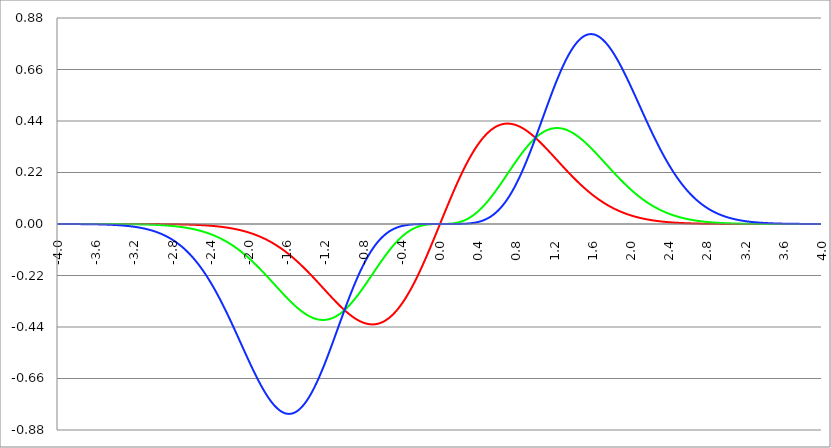
| Category | Series 1 | Series 0 | Series 2 |
|---|---|---|---|
| -4.0 | 0 | 0 | 0 |
| -3.996 | 0 | 0 | 0 |
| -3.992 | 0 | 0 | 0 |
| -3.988 | 0 | 0 | 0 |
| -3.984 | 0 | 0 | 0 |
| -3.98 | 0 | 0 | 0 |
| -3.976 | 0 | 0 | 0 |
| -3.972 | 0 | 0 | 0 |
| -3.968 | 0 | 0 | 0 |
| -3.964 | 0 | 0 | 0 |
| -3.96 | 0 | 0 | 0 |
| -3.956 | 0 | 0 | 0 |
| -3.952 | 0 | 0 | 0 |
| -3.948 | 0 | 0 | 0 |
| -3.944 | 0 | 0 | 0 |
| -3.94 | 0 | 0 | 0 |
| -3.936 | 0 | 0 | 0 |
| -3.932 | 0 | 0 | 0 |
| -3.928 | 0 | 0 | 0 |
| -3.924 | 0 | 0 | 0 |
| -3.92 | 0 | 0 | 0 |
| -3.916 | 0 | 0 | 0 |
| -3.912 | 0 | 0 | 0 |
| -3.908 | 0 | 0 | 0 |
| -3.904 | 0 | 0 | 0 |
| -3.9 | 0 | 0 | 0 |
| -3.896 | 0 | 0 | 0 |
| -3.892 | 0 | 0 | 0 |
| -3.888 | 0 | 0 | 0 |
| -3.884 | 0 | 0 | 0 |
| -3.88 | 0 | 0 | 0 |
| -3.876 | 0 | 0 | 0 |
| -3.872 | 0 | 0 | 0 |
| -3.868 | 0 | 0 | 0 |
| -3.864 | 0 | 0 | 0 |
| -3.86 | 0 | 0 | 0 |
| -3.856 | 0 | 0 | 0 |
| -3.852 | 0 | 0 | 0 |
| -3.848 | 0 | 0 | 0 |
| -3.844 | 0 | 0 | 0 |
| -3.84 | 0 | 0 | 0 |
| -3.836 | 0 | 0 | 0 |
| -3.832 | 0 | 0 | 0 |
| -3.828 | 0 | 0 | 0 |
| -3.824 | 0 | 0 | 0 |
| -3.82 | 0 | 0 | 0 |
| -3.816 | 0 | 0 | 0 |
| -3.812 | 0 | 0 | 0 |
| -3.808 | 0 | 0 | 0 |
| -3.804 | 0 | 0 | 0 |
| -3.8 | 0 | 0 | 0 |
| -3.796 | 0 | 0 | 0 |
| -3.792 | 0 | 0 | 0 |
| -3.788 | 0 | 0 | 0 |
| -3.784 | 0 | 0 | 0 |
| -3.78 | 0 | 0 | 0 |
| -3.776 | 0 | 0 | 0 |
| -3.772 | 0 | 0 | -0.001 |
| -3.768 | 0 | 0 | -0.001 |
| -3.764 | 0 | 0 | -0.001 |
| -3.76 | 0 | 0 | -0.001 |
| -3.756 | 0 | 0 | -0.001 |
| -3.752 | 0 | 0 | -0.001 |
| -3.748 | 0 | 0 | -0.001 |
| -3.744 | 0 | 0 | -0.001 |
| -3.74 | 0 | 0 | -0.001 |
| -3.736 | 0 | 0 | -0.001 |
| -3.732 | 0 | 0 | -0.001 |
| -3.728 | 0 | 0 | -0.001 |
| -3.724 | 0 | 0 | -0.001 |
| -3.72 | 0 | 0 | -0.001 |
| -3.716 | 0 | 0 | -0.001 |
| -3.712 | 0 | 0 | -0.001 |
| -3.708 | 0 | 0 | -0.001 |
| -3.704 | 0 | 0 | -0.001 |
| -3.7 | 0 | 0 | -0.001 |
| -3.696 | 0 | 0 | -0.001 |
| -3.692 | 0 | 0 | -0.001 |
| -3.688 | 0 | 0 | -0.001 |
| -3.684 | 0 | 0 | -0.001 |
| -3.68 | 0 | 0 | -0.001 |
| -3.676 | 0 | 0 | -0.001 |
| -3.672 | 0 | 0 | -0.001 |
| -3.668 | 0 | 0 | -0.001 |
| -3.664 | 0 | 0 | -0.001 |
| -3.66 | 0 | 0 | -0.001 |
| -3.656 | 0 | 0 | -0.001 |
| -3.652 | 0 | 0 | -0.001 |
| -3.648 | 0 | 0 | -0.001 |
| -3.644 | 0 | 0 | -0.001 |
| -3.64 | 0 | 0 | -0.001 |
| -3.636 | 0 | 0 | -0.001 |
| -3.632 | 0 | 0 | -0.001 |
| -3.628 | 0 | 0 | -0.001 |
| -3.624 | 0 | 0 | -0.001 |
| -3.62 | 0 | 0 | -0.001 |
| -3.616 | 0 | 0 | -0.001 |
| -3.612 | 0 | 0 | -0.001 |
| -3.608 | 0 | 0 | -0.001 |
| -3.604 | 0 | 0 | -0.001 |
| -3.6 | 0 | 0 | -0.001 |
| -3.596 | 0 | 0 | -0.001 |
| -3.592 | 0 | 0 | -0.001 |
| -3.588 | 0 | 0 | -0.002 |
| -3.584 | 0 | 0 | -0.002 |
| -3.58 | 0 | 0 | -0.002 |
| -3.576 | 0 | 0 | -0.002 |
| -3.572 | 0 | 0 | -0.002 |
| -3.568 | 0 | 0 | -0.002 |
| -3.564 | 0 | 0 | -0.002 |
| -3.56 | 0 | 0 | -0.002 |
| -3.556 | 0 | 0 | -0.002 |
| -3.552 | 0 | 0 | -0.002 |
| -3.548 | 0 | 0 | -0.002 |
| -3.544 | 0 | 0 | -0.002 |
| -3.54 | 0 | 0 | -0.002 |
| -3.536 | 0 | 0 | -0.002 |
| -3.532 | 0 | 0 | -0.002 |
| -3.528 | 0 | 0 | -0.002 |
| -3.524 | 0 | 0 | -0.002 |
| -3.52 | 0 | 0 | -0.002 |
| -3.516 | 0 | 0 | -0.002 |
| -3.512 | 0 | 0 | -0.002 |
| -3.508 | 0 | 0 | -0.002 |
| -3.504 | 0 | 0 | -0.002 |
| -3.5 | 0 | 0 | -0.003 |
| -3.496 | 0 | 0 | -0.003 |
| -3.492 | 0 | 0 | -0.003 |
| -3.488 | 0 | 0 | -0.003 |
| -3.484 | 0 | 0 | -0.003 |
| -3.48 | 0 | 0 | -0.003 |
| -3.476 | 0 | 0 | -0.003 |
| -3.472 | 0 | 0 | -0.003 |
| -3.467999999999999 | 0 | 0 | -0.003 |
| -3.463999999999999 | 0 | 0 | -0.003 |
| -3.459999999999999 | 0 | 0 | -0.003 |
| -3.455999999999999 | 0 | 0 | -0.003 |
| -3.451999999999999 | 0 | 0 | -0.003 |
| -3.447999999999999 | 0 | 0 | -0.003 |
| -3.443999999999999 | 0 | 0 | -0.003 |
| -3.439999999999999 | 0 | 0 | -0.003 |
| -3.435999999999999 | 0 | 0 | -0.004 |
| -3.431999999999999 | 0 | 0 | -0.004 |
| -3.427999999999999 | 0 | 0 | -0.004 |
| -3.423999999999999 | 0 | 0 | -0.004 |
| -3.419999999999999 | 0 | 0 | -0.004 |
| -3.415999999999999 | 0 | 0 | -0.004 |
| -3.411999999999999 | 0 | 0 | -0.004 |
| -3.407999999999999 | 0 | 0 | -0.004 |
| -3.403999999999999 | 0 | 0 | -0.004 |
| -3.399999999999999 | 0 | 0 | -0.004 |
| -3.395999999999999 | 0 | 0 | -0.004 |
| -3.391999999999999 | 0 | 0 | -0.005 |
| -3.387999999999999 | 0 | 0 | -0.005 |
| -3.383999999999999 | 0 | 0 | -0.005 |
| -3.379999999999999 | 0 | 0 | -0.005 |
| -3.375999999999999 | 0 | 0 | -0.005 |
| -3.371999999999999 | 0 | 0 | -0.005 |
| -3.367999999999999 | 0 | 0 | -0.005 |
| -3.363999999999999 | 0 | 0 | -0.005 |
| -3.359999999999999 | 0 | 0 | -0.005 |
| -3.355999999999999 | 0 | 0 | -0.005 |
| -3.351999999999999 | 0 | 0 | -0.006 |
| -3.347999999999999 | 0 | -0.001 | -0.006 |
| -3.343999999999999 | 0 | -0.001 | -0.006 |
| -3.339999999999999 | 0 | -0.001 | -0.006 |
| -3.335999999999999 | 0 | -0.001 | -0.006 |
| -3.331999999999999 | 0 | -0.001 | -0.006 |
| -3.327999999999999 | 0 | -0.001 | -0.006 |
| -3.323999999999999 | 0 | -0.001 | -0.006 |
| -3.319999999999999 | 0 | -0.001 | -0.007 |
| -3.315999999999999 | 0 | -0.001 | -0.007 |
| -3.311999999999999 | 0 | -0.001 | -0.007 |
| -3.307999999999999 | 0 | -0.001 | -0.007 |
| -3.303999999999999 | 0 | -0.001 | -0.007 |
| -3.299999999999999 | 0 | -0.001 | -0.007 |
| -3.295999999999999 | 0 | -0.001 | -0.007 |
| -3.291999999999999 | 0 | -0.001 | -0.008 |
| -3.288 | 0 | -0.001 | -0.008 |
| -3.284 | 0 | -0.001 | -0.008 |
| -3.279999999999999 | 0 | -0.001 | -0.008 |
| -3.275999999999999 | 0 | -0.001 | -0.008 |
| -3.271999999999999 | 0 | -0.001 | -0.008 |
| -3.268 | 0 | -0.001 | -0.009 |
| -3.264 | 0 | -0.001 | -0.009 |
| -3.259999999999999 | 0 | -0.001 | -0.009 |
| -3.255999999999999 | 0 | -0.001 | -0.009 |
| -3.251999999999999 | 0 | -0.001 | -0.009 |
| -3.248 | 0 | -0.001 | -0.009 |
| -3.244 | 0 | -0.001 | -0.01 |
| -3.239999999999999 | 0 | -0.001 | -0.01 |
| -3.235999999999999 | 0 | -0.001 | -0.01 |
| -3.231999999999999 | 0 | -0.001 | -0.01 |
| -3.228 | 0 | -0.001 | -0.01 |
| -3.224 | 0 | -0.001 | -0.011 |
| -3.219999999999999 | 0 | -0.001 | -0.011 |
| -3.215999999999999 | 0 | -0.001 | -0.011 |
| -3.211999999999999 | 0 | -0.001 | -0.011 |
| -3.208 | 0 | -0.001 | -0.012 |
| -3.204 | 0 | -0.001 | -0.012 |
| -3.199999999999999 | 0 | -0.001 | -0.012 |
| -3.195999999999999 | 0 | -0.001 | -0.012 |
| -3.191999999999999 | 0 | -0.001 | -0.012 |
| -3.188 | 0 | -0.001 | -0.013 |
| -3.184 | 0 | -0.001 | -0.013 |
| -3.179999999999999 | 0 | -0.001 | -0.013 |
| -3.175999999999999 | 0 | -0.001 | -0.013 |
| -3.171999999999999 | 0 | -0.001 | -0.014 |
| -3.168 | 0 | -0.001 | -0.014 |
| -3.164 | 0 | -0.001 | -0.014 |
| -3.159999999999999 | 0 | -0.001 | -0.015 |
| -3.155999999999999 | 0 | -0.001 | -0.015 |
| -3.151999999999999 | 0 | -0.002 | -0.015 |
| -3.148 | 0 | -0.002 | -0.015 |
| -3.144 | 0 | -0.002 | -0.016 |
| -3.139999999999999 | 0 | -0.002 | -0.016 |
| -3.135999999999999 | 0 | -0.002 | -0.016 |
| -3.131999999999999 | 0 | -0.002 | -0.017 |
| -3.128 | 0 | -0.002 | -0.017 |
| -3.124 | 0 | -0.002 | -0.017 |
| -3.119999999999999 | 0 | -0.002 | -0.018 |
| -3.115999999999999 | 0 | -0.002 | -0.018 |
| -3.111999999999999 | 0 | -0.002 | -0.018 |
| -3.108 | 0 | -0.002 | -0.019 |
| -3.104 | 0 | -0.002 | -0.019 |
| -3.099999999999999 | 0 | -0.002 | -0.019 |
| -3.095999999999999 | 0 | -0.002 | -0.02 |
| -3.091999999999999 | 0 | -0.002 | -0.02 |
| -3.088 | 0 | -0.002 | -0.02 |
| -3.084 | 0 | -0.002 | -0.021 |
| -3.079999999999999 | 0 | -0.002 | -0.021 |
| -3.075999999999999 | 0 | -0.002 | -0.021 |
| -3.071999999999999 | 0 | -0.002 | -0.022 |
| -3.068 | 0 | -0.002 | -0.022 |
| -3.064 | 0 | -0.002 | -0.023 |
| -3.059999999999999 | 0 | -0.002 | -0.023 |
| -3.055999999999999 | 0 | -0.003 | -0.023 |
| -3.051999999999999 | 0 | -0.003 | -0.024 |
| -3.048 | 0 | -0.003 | -0.024 |
| -3.044 | 0 | -0.003 | -0.025 |
| -3.039999999999999 | 0 | -0.003 | -0.025 |
| -3.035999999999999 | 0 | -0.003 | -0.026 |
| -3.031999999999999 | 0 | -0.003 | -0.026 |
| -3.028 | 0 | -0.003 | -0.027 |
| -3.024 | 0 | -0.003 | -0.027 |
| -3.019999999999999 | 0 | -0.003 | -0.027 |
| -3.015999999999999 | 0 | -0.003 | -0.028 |
| -3.011999999999999 | 0 | -0.003 | -0.028 |
| -3.008 | 0 | -0.003 | -0.029 |
| -3.004 | 0 | -0.003 | -0.029 |
| -2.999999999999999 | 0 | -0.003 | -0.03 |
| -2.995999999999999 | 0 | -0.003 | -0.031 |
| -2.991999999999999 | 0 | -0.003 | -0.031 |
| -2.988 | 0 | -0.004 | -0.032 |
| -2.984 | 0 | -0.004 | -0.032 |
| -2.979999999999999 | 0 | -0.004 | -0.033 |
| -2.975999999999999 | 0 | -0.004 | -0.033 |
| -2.971999999999999 | 0 | -0.004 | -0.034 |
| -2.968 | 0 | -0.004 | -0.034 |
| -2.964 | 0 | -0.004 | -0.035 |
| -2.959999999999999 | 0 | -0.004 | -0.036 |
| -2.955999999999999 | 0 | -0.004 | -0.036 |
| -2.951999999999999 | 0 | -0.004 | -0.037 |
| -2.948 | 0 | -0.004 | -0.037 |
| -2.944 | -0.001 | -0.004 | -0.038 |
| -2.939999999999999 | -0.001 | -0.004 | -0.039 |
| -2.935999999999999 | -0.001 | -0.005 | -0.039 |
| -2.931999999999999 | -0.001 | -0.005 | -0.04 |
| -2.928 | -0.001 | -0.005 | -0.041 |
| -2.924 | -0.001 | -0.005 | -0.041 |
| -2.919999999999999 | -0.001 | -0.005 | -0.042 |
| -2.915999999999999 | -0.001 | -0.005 | -0.043 |
| -2.911999999999999 | -0.001 | -0.005 | -0.043 |
| -2.908 | -0.001 | -0.005 | -0.044 |
| -2.904 | -0.001 | -0.005 | -0.045 |
| -2.899999999999999 | -0.001 | -0.005 | -0.046 |
| -2.895999999999999 | -0.001 | -0.006 | -0.046 |
| -2.891999999999999 | -0.001 | -0.006 | -0.047 |
| -2.887999999999999 | -0.001 | -0.006 | -0.048 |
| -2.883999999999999 | -0.001 | -0.006 | -0.049 |
| -2.879999999999999 | -0.001 | -0.006 | -0.05 |
| -2.875999999999999 | -0.001 | -0.006 | -0.05 |
| -2.871999999999999 | -0.001 | -0.006 | -0.051 |
| -2.867999999999999 | -0.001 | -0.006 | -0.052 |
| -2.863999999999999 | -0.001 | -0.006 | -0.053 |
| -2.859999999999999 | -0.001 | -0.007 | -0.054 |
| -2.855999999999999 | -0.001 | -0.007 | -0.054 |
| -2.851999999999999 | -0.001 | -0.007 | -0.055 |
| -2.847999999999999 | -0.001 | -0.007 | -0.056 |
| -2.843999999999999 | -0.001 | -0.007 | -0.057 |
| -2.839999999999999 | -0.001 | -0.007 | -0.058 |
| -2.835999999999999 | -0.001 | -0.007 | -0.059 |
| -2.831999999999999 | -0.001 | -0.007 | -0.06 |
| -2.827999999999999 | -0.001 | -0.008 | -0.061 |
| -2.823999999999999 | -0.001 | -0.008 | -0.062 |
| -2.819999999999999 | -0.001 | -0.008 | -0.063 |
| -2.815999999999999 | -0.001 | -0.008 | -0.064 |
| -2.811999999999999 | -0.001 | -0.008 | -0.065 |
| -2.807999999999999 | -0.001 | -0.008 | -0.066 |
| -2.803999999999999 | -0.001 | -0.008 | -0.067 |
| -2.799999999999999 | -0.001 | -0.009 | -0.068 |
| -2.795999999999999 | -0.001 | -0.009 | -0.069 |
| -2.791999999999999 | -0.001 | -0.009 | -0.07 |
| -2.787999999999999 | -0.001 | -0.009 | -0.071 |
| -2.783999999999999 | -0.001 | -0.009 | -0.072 |
| -2.779999999999999 | -0.001 | -0.009 | -0.073 |
| -2.775999999999999 | -0.001 | -0.01 | -0.074 |
| -2.771999999999999 | -0.001 | -0.01 | -0.075 |
| -2.767999999999999 | -0.001 | -0.01 | -0.076 |
| -2.763999999999999 | -0.001 | -0.01 | -0.078 |
| -2.759999999999999 | -0.001 | -0.01 | -0.079 |
| -2.755999999999999 | -0.001 | -0.011 | -0.08 |
| -2.751999999999999 | -0.001 | -0.011 | -0.081 |
| -2.747999999999999 | -0.001 | -0.011 | -0.082 |
| -2.743999999999999 | -0.001 | -0.011 | -0.084 |
| -2.739999999999999 | -0.002 | -0.011 | -0.085 |
| -2.735999999999999 | -0.002 | -0.011 | -0.086 |
| -2.731999999999999 | -0.002 | -0.012 | -0.087 |
| -2.727999999999999 | -0.002 | -0.012 | -0.089 |
| -2.723999999999999 | -0.002 | -0.012 | -0.09 |
| -2.719999999999999 | -0.002 | -0.012 | -0.091 |
| -2.715999999999999 | -0.002 | -0.013 | -0.092 |
| -2.711999999999999 | -0.002 | -0.013 | -0.094 |
| -2.707999999999999 | -0.002 | -0.013 | -0.095 |
| -2.703999999999999 | -0.002 | -0.013 | -0.097 |
| -2.699999999999999 | -0.002 | -0.013 | -0.098 |
| -2.695999999999999 | -0.002 | -0.014 | -0.099 |
| -2.691999999999999 | -0.002 | -0.014 | -0.101 |
| -2.687999999999999 | -0.002 | -0.014 | -0.102 |
| -2.683999999999999 | -0.002 | -0.014 | -0.104 |
| -2.679999999999999 | -0.002 | -0.015 | -0.105 |
| -2.675999999999999 | -0.002 | -0.015 | -0.107 |
| -2.671999999999999 | -0.002 | -0.015 | -0.108 |
| -2.667999999999999 | -0.002 | -0.015 | -0.11 |
| -2.663999999999999 | -0.002 | -0.016 | -0.111 |
| -2.659999999999999 | -0.002 | -0.016 | -0.113 |
| -2.655999999999999 | -0.002 | -0.016 | -0.114 |
| -2.651999999999999 | -0.002 | -0.016 | -0.116 |
| -2.647999999999999 | -0.002 | -0.017 | -0.117 |
| -2.643999999999999 | -0.002 | -0.017 | -0.119 |
| -2.639999999999999 | -0.002 | -0.017 | -0.121 |
| -2.635999999999999 | -0.003 | -0.018 | -0.122 |
| -2.631999999999999 | -0.003 | -0.018 | -0.124 |
| -2.627999999999999 | -0.003 | -0.018 | -0.126 |
| -2.623999999999999 | -0.003 | -0.018 | -0.127 |
| -2.619999999999999 | -0.003 | -0.019 | -0.129 |
| -2.615999999999999 | -0.003 | -0.019 | -0.131 |
| -2.611999999999999 | -0.003 | -0.019 | -0.132 |
| -2.607999999999999 | -0.003 | -0.02 | -0.134 |
| -2.603999999999999 | -0.003 | -0.02 | -0.136 |
| -2.599999999999999 | -0.003 | -0.02 | -0.138 |
| -2.595999999999999 | -0.003 | -0.021 | -0.14 |
| -2.591999999999999 | -0.003 | -0.021 | -0.141 |
| -2.587999999999999 | -0.003 | -0.021 | -0.143 |
| -2.583999999999999 | -0.003 | -0.022 | -0.145 |
| -2.579999999999999 | -0.003 | -0.022 | -0.147 |
| -2.575999999999999 | -0.003 | -0.022 | -0.149 |
| -2.571999999999999 | -0.003 | -0.023 | -0.151 |
| -2.567999999999999 | -0.004 | -0.023 | -0.153 |
| -2.563999999999999 | -0.004 | -0.024 | -0.155 |
| -2.559999999999999 | -0.004 | -0.024 | -0.157 |
| -2.555999999999999 | -0.004 | -0.024 | -0.159 |
| -2.551999999999999 | -0.004 | -0.025 | -0.161 |
| -2.547999999999999 | -0.004 | -0.025 | -0.163 |
| -2.543999999999999 | -0.004 | -0.025 | -0.165 |
| -2.539999999999999 | -0.004 | -0.026 | -0.167 |
| -2.535999999999999 | -0.004 | -0.026 | -0.169 |
| -2.531999999999999 | -0.004 | -0.027 | -0.171 |
| -2.527999999999999 | -0.004 | -0.027 | -0.173 |
| -2.523999999999999 | -0.004 | -0.028 | -0.175 |
| -2.519999999999999 | -0.004 | -0.028 | -0.177 |
| -2.515999999999999 | -0.004 | -0.028 | -0.18 |
| -2.511999999999999 | -0.005 | -0.029 | -0.182 |
| -2.507999999999999 | -0.005 | -0.029 | -0.184 |
| -2.503999999999999 | -0.005 | -0.03 | -0.186 |
| -2.499999999999999 | -0.005 | -0.03 | -0.189 |
| -2.495999999999999 | -0.005 | -0.031 | -0.191 |
| -2.491999999999999 | -0.005 | -0.031 | -0.193 |
| -2.487999999999999 | -0.005 | -0.032 | -0.195 |
| -2.483999999999999 | -0.005 | -0.032 | -0.198 |
| -2.479999999999999 | -0.005 | -0.033 | -0.2 |
| -2.475999999999999 | -0.005 | -0.033 | -0.202 |
| -2.471999999999999 | -0.005 | -0.034 | -0.205 |
| -2.467999999999999 | -0.006 | -0.034 | -0.207 |
| -2.463999999999999 | -0.006 | -0.035 | -0.21 |
| -2.459999999999999 | -0.006 | -0.035 | -0.212 |
| -2.455999999999999 | -0.006 | -0.036 | -0.215 |
| -2.451999999999999 | -0.006 | -0.036 | -0.217 |
| -2.447999999999999 | -0.006 | -0.037 | -0.22 |
| -2.443999999999999 | -0.006 | -0.037 | -0.222 |
| -2.439999999999999 | -0.006 | -0.038 | -0.225 |
| -2.435999999999999 | -0.006 | -0.038 | -0.227 |
| -2.431999999999999 | -0.007 | -0.039 | -0.23 |
| -2.427999999999999 | -0.007 | -0.039 | -0.232 |
| -2.423999999999999 | -0.007 | -0.04 | -0.235 |
| -2.419999999999999 | -0.007 | -0.041 | -0.238 |
| -2.415999999999999 | -0.007 | -0.041 | -0.24 |
| -2.411999999999999 | -0.007 | -0.042 | -0.243 |
| -2.407999999999999 | -0.007 | -0.042 | -0.245 |
| -2.403999999999999 | -0.007 | -0.043 | -0.248 |
| -2.399999999999999 | -0.008 | -0.044 | -0.251 |
| -2.395999999999999 | -0.008 | -0.044 | -0.254 |
| -2.391999999999999 | -0.008 | -0.045 | -0.256 |
| -2.387999999999999 | -0.008 | -0.045 | -0.259 |
| -2.383999999999999 | -0.008 | -0.046 | -0.262 |
| -2.379999999999999 | -0.008 | -0.047 | -0.265 |
| -2.375999999999999 | -0.008 | -0.047 | -0.268 |
| -2.371999999999999 | -0.009 | -0.048 | -0.27 |
| -2.367999999999998 | -0.009 | -0.049 | -0.273 |
| -2.363999999999998 | -0.009 | -0.049 | -0.276 |
| -2.359999999999998 | -0.009 | -0.05 | -0.279 |
| -2.355999999999998 | -0.009 | -0.051 | -0.282 |
| -2.351999999999998 | -0.009 | -0.052 | -0.285 |
| -2.347999999999998 | -0.009 | -0.052 | -0.288 |
| -2.343999999999998 | -0.01 | -0.053 | -0.291 |
| -2.339999999999998 | -0.01 | -0.054 | -0.294 |
| -2.335999999999998 | -0.01 | -0.054 | -0.297 |
| -2.331999999999998 | -0.01 | -0.055 | -0.3 |
| -2.327999999999998 | -0.01 | -0.056 | -0.303 |
| -2.323999999999998 | -0.01 | -0.057 | -0.306 |
| -2.319999999999998 | -0.011 | -0.057 | -0.309 |
| -2.315999999999998 | -0.011 | -0.058 | -0.312 |
| -2.311999999999998 | -0.011 | -0.059 | -0.315 |
| -2.307999999999998 | -0.011 | -0.06 | -0.318 |
| -2.303999999999998 | -0.011 | -0.061 | -0.321 |
| -2.299999999999998 | -0.012 | -0.061 | -0.325 |
| -2.295999999999998 | -0.012 | -0.062 | -0.328 |
| -2.291999999999998 | -0.012 | -0.063 | -0.331 |
| -2.287999999999998 | -0.012 | -0.064 | -0.334 |
| -2.283999999999998 | -0.012 | -0.065 | -0.337 |
| -2.279999999999998 | -0.013 | -0.065 | -0.34 |
| -2.275999999999998 | -0.013 | -0.066 | -0.344 |
| -2.271999999999998 | -0.013 | -0.067 | -0.347 |
| -2.267999999999998 | -0.013 | -0.068 | -0.35 |
| -2.263999999999998 | -0.013 | -0.069 | -0.353 |
| -2.259999999999998 | -0.014 | -0.07 | -0.357 |
| -2.255999999999998 | -0.014 | -0.071 | -0.36 |
| -2.251999999999998 | -0.014 | -0.072 | -0.363 |
| -2.247999999999998 | -0.014 | -0.073 | -0.367 |
| -2.243999999999998 | -0.015 | -0.073 | -0.37 |
| -2.239999999999998 | -0.015 | -0.074 | -0.373 |
| -2.235999999999998 | -0.015 | -0.075 | -0.377 |
| -2.231999999999998 | -0.015 | -0.076 | -0.38 |
| -2.227999999999998 | -0.016 | -0.077 | -0.383 |
| -2.223999999999998 | -0.016 | -0.078 | -0.387 |
| -2.219999999999998 | -0.016 | -0.079 | -0.39 |
| -2.215999999999998 | -0.016 | -0.08 | -0.394 |
| -2.211999999999998 | -0.017 | -0.081 | -0.397 |
| -2.207999999999998 | -0.017 | -0.082 | -0.401 |
| -2.203999999999998 | -0.017 | -0.083 | -0.404 |
| -2.199999999999998 | -0.017 | -0.084 | -0.408 |
| -2.195999999999998 | -0.018 | -0.085 | -0.411 |
| -2.191999999999998 | -0.018 | -0.086 | -0.414 |
| -2.187999999999998 | -0.018 | -0.087 | -0.418 |
| -2.183999999999998 | -0.019 | -0.088 | -0.421 |
| -2.179999999999998 | -0.019 | -0.089 | -0.425 |
| -2.175999999999998 | -0.019 | -0.09 | -0.428 |
| -2.171999999999998 | -0.019 | -0.092 | -0.432 |
| -2.167999999999998 | -0.02 | -0.093 | -0.436 |
| -2.163999999999998 | -0.02 | -0.094 | -0.439 |
| -2.159999999999998 | -0.02 | -0.095 | -0.443 |
| -2.155999999999998 | -0.021 | -0.096 | -0.446 |
| -2.151999999999998 | -0.021 | -0.097 | -0.45 |
| -2.147999999999998 | -0.021 | -0.098 | -0.453 |
| -2.143999999999998 | -0.022 | -0.099 | -0.457 |
| -2.139999999999998 | -0.022 | -0.101 | -0.46 |
| -2.135999999999998 | -0.022 | -0.102 | -0.464 |
| -2.131999999999998 | -0.023 | -0.103 | -0.468 |
| -2.127999999999998 | -0.023 | -0.104 | -0.471 |
| -2.123999999999998 | -0.023 | -0.105 | -0.475 |
| -2.119999999999998 | -0.024 | -0.106 | -0.478 |
| -2.115999999999998 | -0.024 | -0.108 | -0.482 |
| -2.111999999999998 | -0.024 | -0.109 | -0.486 |
| -2.107999999999998 | -0.025 | -0.11 | -0.489 |
| -2.103999999999998 | -0.025 | -0.111 | -0.493 |
| -2.099999999999998 | -0.026 | -0.113 | -0.496 |
| -2.095999999999998 | -0.026 | -0.114 | -0.5 |
| -2.091999999999998 | -0.026 | -0.115 | -0.504 |
| -2.087999999999998 | -0.027 | -0.116 | -0.507 |
| -2.083999999999998 | -0.027 | -0.118 | -0.511 |
| -2.079999999999998 | -0.027 | -0.119 | -0.514 |
| -2.075999999999998 | -0.028 | -0.12 | -0.518 |
| -2.071999999999998 | -0.028 | -0.122 | -0.522 |
| -2.067999999999998 | -0.029 | -0.123 | -0.525 |
| -2.063999999999998 | -0.029 | -0.124 | -0.529 |
| -2.059999999999998 | -0.03 | -0.125 | -0.533 |
| -2.055999999999998 | -0.03 | -0.127 | -0.536 |
| -2.051999999999998 | -0.03 | -0.128 | -0.54 |
| -2.047999999999998 | -0.031 | -0.13 | -0.543 |
| -2.043999999999998 | -0.031 | -0.131 | -0.547 |
| -2.039999999999998 | -0.032 | -0.132 | -0.551 |
| -2.035999999999998 | -0.032 | -0.134 | -0.554 |
| -2.031999999999998 | -0.033 | -0.135 | -0.558 |
| -2.027999999999998 | -0.033 | -0.136 | -0.561 |
| -2.023999999999998 | -0.034 | -0.138 | -0.565 |
| -2.019999999999998 | -0.034 | -0.139 | -0.568 |
| -2.015999999999998 | -0.035 | -0.141 | -0.572 |
| -2.011999999999998 | -0.035 | -0.142 | -0.576 |
| -2.007999999999998 | -0.036 | -0.144 | -0.579 |
| -2.003999999999998 | -0.036 | -0.145 | -0.583 |
| -1.999999999999998 | -0.037 | -0.147 | -0.586 |
| -1.995999999999998 | -0.037 | -0.148 | -0.59 |
| -1.991999999999998 | -0.038 | -0.149 | -0.593 |
| -1.987999999999998 | -0.038 | -0.151 | -0.597 |
| -1.983999999999998 | -0.039 | -0.152 | -0.6 |
| -1.979999999999998 | -0.039 | -0.154 | -0.604 |
| -1.975999999999998 | -0.04 | -0.155 | -0.607 |
| -1.971999999999998 | -0.04 | -0.157 | -0.61 |
| -1.967999999999998 | -0.041 | -0.159 | -0.614 |
| -1.963999999999998 | -0.041 | -0.16 | -0.617 |
| -1.959999999999998 | -0.042 | -0.162 | -0.621 |
| -1.955999999999998 | -0.043 | -0.163 | -0.624 |
| -1.951999999999998 | -0.043 | -0.165 | -0.627 |
| -1.947999999999998 | -0.044 | -0.166 | -0.631 |
| -1.943999999999998 | -0.044 | -0.168 | -0.634 |
| -1.939999999999998 | -0.045 | -0.169 | -0.638 |
| -1.935999999999998 | -0.046 | -0.171 | -0.641 |
| -1.931999999999998 | -0.046 | -0.173 | -0.644 |
| -1.927999999999998 | -0.047 | -0.174 | -0.647 |
| -1.923999999999998 | -0.047 | -0.176 | -0.651 |
| -1.919999999999998 | -0.048 | -0.177 | -0.654 |
| -1.915999999999998 | -0.049 | -0.179 | -0.657 |
| -1.911999999999998 | -0.049 | -0.181 | -0.66 |
| -1.907999999999998 | -0.05 | -0.182 | -0.664 |
| -1.903999999999998 | -0.051 | -0.184 | -0.667 |
| -1.899999999999998 | -0.051 | -0.186 | -0.67 |
| -1.895999999999998 | -0.052 | -0.187 | -0.673 |
| -1.891999999999998 | -0.053 | -0.189 | -0.676 |
| -1.887999999999998 | -0.053 | -0.191 | -0.679 |
| -1.883999999999998 | -0.054 | -0.192 | -0.682 |
| -1.879999999999998 | -0.055 | -0.194 | -0.685 |
| -1.875999999999998 | -0.056 | -0.196 | -0.688 |
| -1.871999999999998 | -0.056 | -0.197 | -0.691 |
| -1.867999999999998 | -0.057 | -0.199 | -0.694 |
| -1.863999999999998 | -0.058 | -0.201 | -0.697 |
| -1.859999999999998 | -0.058 | -0.202 | -0.7 |
| -1.855999999999998 | -0.059 | -0.204 | -0.703 |
| -1.851999999999998 | -0.06 | -0.206 | -0.706 |
| -1.847999999999998 | -0.061 | -0.207 | -0.709 |
| -1.843999999999998 | -0.062 | -0.209 | -0.711 |
| -1.839999999999998 | -0.062 | -0.211 | -0.714 |
| -1.835999999999998 | -0.063 | -0.213 | -0.717 |
| -1.831999999999998 | -0.064 | -0.214 | -0.72 |
| -1.827999999999998 | -0.065 | -0.216 | -0.722 |
| -1.823999999999998 | -0.065 | -0.218 | -0.725 |
| -1.819999999999998 | -0.066 | -0.22 | -0.727 |
| -1.815999999999998 | -0.067 | -0.221 | -0.73 |
| -1.811999999999998 | -0.068 | -0.223 | -0.733 |
| -1.807999999999998 | -0.069 | -0.225 | -0.735 |
| -1.803999999999998 | -0.07 | -0.227 | -0.738 |
| -1.799999999999998 | -0.07 | -0.228 | -0.74 |
| -1.795999999999998 | -0.071 | -0.23 | -0.742 |
| -1.791999999999998 | -0.072 | -0.232 | -0.745 |
| -1.787999999999998 | -0.073 | -0.234 | -0.747 |
| -1.783999999999998 | -0.074 | -0.235 | -0.749 |
| -1.779999999999998 | -0.075 | -0.237 | -0.752 |
| -1.775999999999998 | -0.076 | -0.239 | -0.754 |
| -1.771999999999998 | -0.077 | -0.241 | -0.756 |
| -1.767999999999998 | -0.078 | -0.243 | -0.758 |
| -1.763999999999998 | -0.079 | -0.244 | -0.761 |
| -1.759999999999998 | -0.079 | -0.246 | -0.763 |
| -1.755999999999998 | -0.08 | -0.248 | -0.765 |
| -1.751999999999998 | -0.081 | -0.25 | -0.767 |
| -1.747999999999998 | -0.082 | -0.252 | -0.769 |
| -1.743999999999998 | -0.083 | -0.253 | -0.771 |
| -1.739999999999998 | -0.084 | -0.255 | -0.772 |
| -1.735999999999998 | -0.085 | -0.257 | -0.774 |
| -1.731999999999998 | -0.086 | -0.259 | -0.776 |
| -1.727999999999998 | -0.087 | -0.261 | -0.778 |
| -1.723999999999998 | -0.088 | -0.262 | -0.78 |
| -1.719999999999998 | -0.089 | -0.264 | -0.781 |
| -1.715999999999998 | -0.09 | -0.266 | -0.783 |
| -1.711999999999998 | -0.091 | -0.268 | -0.785 |
| -1.707999999999998 | -0.092 | -0.269 | -0.786 |
| -1.703999999999998 | -0.093 | -0.271 | -0.788 |
| -1.699999999999998 | -0.094 | -0.273 | -0.789 |
| -1.695999999999998 | -0.096 | -0.275 | -0.791 |
| -1.691999999999998 | -0.097 | -0.277 | -0.792 |
| -1.687999999999998 | -0.098 | -0.278 | -0.793 |
| -1.683999999999998 | -0.099 | -0.28 | -0.795 |
| -1.679999999999998 | -0.1 | -0.282 | -0.796 |
| -1.675999999999998 | -0.101 | -0.284 | -0.797 |
| -1.671999999999998 | -0.102 | -0.285 | -0.798 |
| -1.667999999999998 | -0.103 | -0.287 | -0.799 |
| -1.663999999999998 | -0.104 | -0.289 | -0.8 |
| -1.659999999999998 | -0.106 | -0.291 | -0.801 |
| -1.655999999999998 | -0.107 | -0.293 | -0.802 |
| -1.651999999999998 | -0.108 | -0.294 | -0.803 |
| -1.647999999999998 | -0.109 | -0.296 | -0.804 |
| -1.643999999999998 | -0.11 | -0.298 | -0.805 |
| -1.639999999999998 | -0.111 | -0.3 | -0.806 |
| -1.635999999999998 | -0.113 | -0.301 | -0.806 |
| -1.631999999999998 | -0.114 | -0.303 | -0.807 |
| -1.627999999999998 | -0.115 | -0.305 | -0.808 |
| -1.623999999999998 | -0.116 | -0.306 | -0.808 |
| -1.619999999999998 | -0.117 | -0.308 | -0.809 |
| -1.615999999999998 | -0.119 | -0.31 | -0.809 |
| -1.611999999999998 | -0.12 | -0.312 | -0.81 |
| -1.607999999999998 | -0.121 | -0.313 | -0.81 |
| -1.603999999999998 | -0.122 | -0.315 | -0.81 |
| -1.599999999999998 | -0.124 | -0.317 | -0.811 |
| -1.595999999999998 | -0.125 | -0.318 | -0.811 |
| -1.591999999999998 | -0.126 | -0.32 | -0.811 |
| -1.587999999999998 | -0.128 | -0.322 | -0.811 |
| -1.583999999999998 | -0.129 | -0.323 | -0.811 |
| -1.579999999999998 | -0.13 | -0.325 | -0.811 |
| -1.575999999999998 | -0.131 | -0.327 | -0.811 |
| -1.571999999999998 | -0.133 | -0.328 | -0.811 |
| -1.567999999999998 | -0.134 | -0.33 | -0.811 |
| -1.563999999999998 | -0.135 | -0.331 | -0.811 |
| -1.559999999999998 | -0.137 | -0.333 | -0.81 |
| -1.555999999999998 | -0.138 | -0.335 | -0.81 |
| -1.551999999999998 | -0.14 | -0.336 | -0.81 |
| -1.547999999999998 | -0.141 | -0.338 | -0.809 |
| -1.543999999999998 | -0.142 | -0.339 | -0.809 |
| -1.539999999999998 | -0.144 | -0.341 | -0.808 |
| -1.535999999999998 | -0.145 | -0.342 | -0.808 |
| -1.531999999999998 | -0.147 | -0.344 | -0.807 |
| -1.527999999999998 | -0.148 | -0.345 | -0.807 |
| -1.523999999999998 | -0.149 | -0.347 | -0.806 |
| -1.519999999999998 | -0.151 | -0.348 | -0.805 |
| -1.515999999999998 | -0.152 | -0.35 | -0.804 |
| -1.511999999999998 | -0.154 | -0.351 | -0.803 |
| -1.507999999999998 | -0.155 | -0.353 | -0.802 |
| -1.503999999999998 | -0.157 | -0.354 | -0.801 |
| -1.499999999999998 | -0.158 | -0.356 | -0.8 |
| -1.495999999999998 | -0.16 | -0.357 | -0.799 |
| -1.491999999999998 | -0.161 | -0.359 | -0.798 |
| -1.487999999999998 | -0.163 | -0.36 | -0.797 |
| -1.483999999999998 | -0.164 | -0.361 | -0.796 |
| -1.479999999999998 | -0.166 | -0.363 | -0.794 |
| -1.475999999999998 | -0.167 | -0.364 | -0.793 |
| -1.471999999999998 | -0.169 | -0.365 | -0.792 |
| -1.467999999999998 | -0.17 | -0.367 | -0.79 |
| -1.463999999999998 | -0.172 | -0.368 | -0.789 |
| -1.459999999999998 | -0.173 | -0.369 | -0.787 |
| -1.455999999999998 | -0.175 | -0.371 | -0.785 |
| -1.451999999999998 | -0.176 | -0.372 | -0.784 |
| -1.447999999999998 | -0.178 | -0.373 | -0.782 |
| -1.443999999999998 | -0.179 | -0.374 | -0.78 |
| -1.439999999999998 | -0.181 | -0.375 | -0.779 |
| -1.435999999999998 | -0.183 | -0.377 | -0.777 |
| -1.431999999999998 | -0.184 | -0.378 | -0.775 |
| -1.427999999999998 | -0.186 | -0.379 | -0.773 |
| -1.423999999999998 | -0.187 | -0.38 | -0.771 |
| -1.419999999999998 | -0.189 | -0.381 | -0.769 |
| -1.415999999999998 | -0.191 | -0.382 | -0.767 |
| -1.411999999999998 | -0.192 | -0.383 | -0.764 |
| -1.407999999999998 | -0.194 | -0.384 | -0.762 |
| -1.403999999999998 | -0.196 | -0.385 | -0.76 |
| -1.399999999999998 | -0.197 | -0.387 | -0.758 |
| -1.395999999999998 | -0.199 | -0.388 | -0.755 |
| -1.391999999999998 | -0.201 | -0.389 | -0.753 |
| -1.387999999999998 | -0.202 | -0.389 | -0.75 |
| -1.383999999999998 | -0.204 | -0.39 | -0.748 |
| -1.379999999999998 | -0.205 | -0.391 | -0.745 |
| -1.375999999999998 | -0.207 | -0.392 | -0.743 |
| -1.371999999999998 | -0.209 | -0.393 | -0.74 |
| -1.367999999999998 | -0.211 | -0.394 | -0.737 |
| -1.363999999999998 | -0.212 | -0.395 | -0.735 |
| -1.359999999999998 | -0.214 | -0.396 | -0.732 |
| -1.355999999999998 | -0.216 | -0.396 | -0.729 |
| -1.351999999999998 | -0.217 | -0.397 | -0.726 |
| -1.347999999999998 | -0.219 | -0.398 | -0.723 |
| -1.343999999999998 | -0.221 | -0.399 | -0.72 |
| -1.339999999999998 | -0.222 | -0.399 | -0.717 |
| -1.335999999999998 | -0.224 | -0.4 | -0.714 |
| -1.331999999999998 | -0.226 | -0.401 | -0.711 |
| -1.327999999999998 | -0.228 | -0.401 | -0.708 |
| -1.323999999999998 | -0.229 | -0.402 | -0.705 |
| -1.319999999999998 | -0.231 | -0.403 | -0.702 |
| -1.315999999999998 | -0.233 | -0.403 | -0.698 |
| -1.311999999999998 | -0.235 | -0.404 | -0.695 |
| -1.307999999999998 | -0.236 | -0.404 | -0.692 |
| -1.303999999999998 | -0.238 | -0.405 | -0.689 |
| -1.299999999999998 | -0.24 | -0.405 | -0.685 |
| -1.295999999999998 | -0.242 | -0.406 | -0.682 |
| -1.291999999999998 | -0.243 | -0.406 | -0.678 |
| -1.287999999999998 | -0.245 | -0.407 | -0.675 |
| -1.283999999999998 | -0.247 | -0.407 | -0.671 |
| -1.279999999999998 | -0.249 | -0.407 | -0.668 |
| -1.275999999999998 | -0.25 | -0.408 | -0.664 |
| -1.271999999999998 | -0.252 | -0.408 | -0.66 |
| -1.267999999999998 | -0.254 | -0.408 | -0.657 |
| -1.263999999999998 | -0.256 | -0.409 | -0.653 |
| -1.259999999999998 | -0.258 | -0.409 | -0.649 |
| -1.255999999999998 | -0.259 | -0.409 | -0.645 |
| -1.251999999999998 | -0.261 | -0.409 | -0.642 |
| -1.247999999999998 | -0.263 | -0.409 | -0.638 |
| -1.243999999999998 | -0.265 | -0.41 | -0.634 |
| -1.239999999999998 | -0.266 | -0.41 | -0.63 |
| -1.235999999999998 | -0.268 | -0.41 | -0.626 |
| -1.231999999999998 | -0.27 | -0.41 | -0.622 |
| -1.227999999999998 | -0.272 | -0.41 | -0.618 |
| -1.223999999999998 | -0.274 | -0.41 | -0.614 |
| -1.219999999999998 | -0.275 | -0.41 | -0.61 |
| -1.215999999999998 | -0.277 | -0.41 | -0.606 |
| -1.211999999999998 | -0.279 | -0.41 | -0.602 |
| -1.207999999999998 | -0.281 | -0.41 | -0.598 |
| -1.203999999999998 | -0.283 | -0.41 | -0.594 |
| -1.199999999999997 | -0.284 | -0.409 | -0.59 |
| -1.195999999999997 | -0.286 | -0.409 | -0.585 |
| -1.191999999999997 | -0.288 | -0.409 | -0.581 |
| -1.187999999999997 | -0.29 | -0.409 | -0.577 |
| -1.183999999999997 | -0.291 | -0.409 | -0.573 |
| -1.179999999999997 | -0.293 | -0.408 | -0.568 |
| -1.175999999999997 | -0.295 | -0.408 | -0.564 |
| -1.171999999999997 | -0.297 | -0.408 | -0.56 |
| -1.167999999999997 | -0.299 | -0.407 | -0.556 |
| -1.163999999999997 | -0.3 | -0.407 | -0.551 |
| -1.159999999999997 | -0.302 | -0.406 | -0.547 |
| -1.155999999999997 | -0.304 | -0.406 | -0.543 |
| -1.151999999999997 | -0.306 | -0.406 | -0.538 |
| -1.147999999999997 | -0.307 | -0.405 | -0.534 |
| -1.143999999999997 | -0.309 | -0.404 | -0.529 |
| -1.139999999999997 | -0.311 | -0.404 | -0.525 |
| -1.135999999999997 | -0.313 | -0.403 | -0.521 |
| -1.131999999999997 | -0.314 | -0.403 | -0.516 |
| -1.127999999999997 | -0.316 | -0.402 | -0.512 |
| -1.123999999999997 | -0.318 | -0.401 | -0.507 |
| -1.119999999999997 | -0.319 | -0.401 | -0.503 |
| -1.115999999999997 | -0.321 | -0.4 | -0.498 |
| -1.111999999999997 | -0.323 | -0.399 | -0.494 |
| -1.107999999999997 | -0.325 | -0.399 | -0.489 |
| -1.103999999999997 | -0.326 | -0.398 | -0.485 |
| -1.099999999999997 | -0.328 | -0.397 | -0.48 |
| -1.095999999999997 | -0.33 | -0.396 | -0.476 |
| -1.091999999999997 | -0.331 | -0.395 | -0.471 |
| -1.087999999999997 | -0.333 | -0.394 | -0.467 |
| -1.083999999999997 | -0.335 | -0.393 | -0.462 |
| -1.079999999999997 | -0.336 | -0.392 | -0.458 |
| -1.075999999999997 | -0.338 | -0.391 | -0.453 |
| -1.071999999999997 | -0.34 | -0.39 | -0.449 |
| -1.067999999999997 | -0.341 | -0.389 | -0.444 |
| -1.063999999999997 | -0.343 | -0.388 | -0.44 |
| -1.059999999999997 | -0.345 | -0.387 | -0.435 |
| -1.055999999999997 | -0.346 | -0.386 | -0.431 |
| -1.051999999999997 | -0.348 | -0.385 | -0.426 |
| -1.047999999999997 | -0.349 | -0.384 | -0.422 |
| -1.043999999999997 | -0.351 | -0.383 | -0.417 |
| -1.039999999999997 | -0.353 | -0.381 | -0.413 |
| -1.035999999999997 | -0.354 | -0.38 | -0.408 |
| -1.031999999999997 | -0.356 | -0.379 | -0.404 |
| -1.027999999999997 | -0.357 | -0.378 | -0.399 |
| -1.023999999999997 | -0.359 | -0.376 | -0.395 |
| -1.019999999999997 | -0.36 | -0.375 | -0.39 |
| -1.015999999999997 | -0.362 | -0.374 | -0.386 |
| -1.011999999999997 | -0.363 | -0.372 | -0.381 |
| -1.007999999999997 | -0.365 | -0.371 | -0.377 |
| -1.003999999999997 | -0.366 | -0.369 | -0.372 |
| -0.999999999999997 | -0.368 | -0.368 | -0.368 |
| -0.995999999999997 | -0.369 | -0.366 | -0.363 |
| -0.991999999999997 | -0.371 | -0.365 | -0.359 |
| -0.987999999999997 | -0.372 | -0.363 | -0.355 |
| -0.983999999999997 | -0.374 | -0.362 | -0.35 |
| -0.979999999999997 | -0.375 | -0.36 | -0.346 |
| -0.975999999999997 | -0.376 | -0.359 | -0.342 |
| -0.971999999999997 | -0.378 | -0.357 | -0.337 |
| -0.967999999999997 | -0.379 | -0.355 | -0.333 |
| -0.963999999999997 | -0.381 | -0.354 | -0.329 |
| -0.959999999999997 | -0.382 | -0.352 | -0.324 |
| -0.955999999999997 | -0.383 | -0.35 | -0.32 |
| -0.951999999999997 | -0.385 | -0.349 | -0.316 |
| -0.947999999999997 | -0.386 | -0.347 | -0.312 |
| -0.943999999999997 | -0.387 | -0.345 | -0.307 |
| -0.939999999999997 | -0.388 | -0.343 | -0.303 |
| -0.935999999999997 | -0.39 | -0.341 | -0.299 |
| -0.931999999999997 | -0.391 | -0.34 | -0.295 |
| -0.927999999999997 | -0.392 | -0.338 | -0.291 |
| -0.923999999999997 | -0.393 | -0.336 | -0.287 |
| -0.919999999999997 | -0.395 | -0.334 | -0.283 |
| -0.915999999999997 | -0.396 | -0.332 | -0.279 |
| -0.911999999999997 | -0.397 | -0.33 | -0.275 |
| -0.907999999999997 | -0.398 | -0.328 | -0.271 |
| -0.903999999999997 | -0.399 | -0.326 | -0.267 |
| -0.899999999999997 | -0.4 | -0.324 | -0.263 |
| -0.895999999999997 | -0.401 | -0.322 | -0.259 |
| -0.891999999999997 | -0.403 | -0.32 | -0.255 |
| -0.887999999999997 | -0.404 | -0.318 | -0.251 |
| -0.883999999999997 | -0.405 | -0.316 | -0.247 |
| -0.879999999999997 | -0.406 | -0.314 | -0.243 |
| -0.875999999999997 | -0.407 | -0.312 | -0.239 |
| -0.871999999999997 | -0.408 | -0.31 | -0.236 |
| -0.867999999999997 | -0.409 | -0.308 | -0.232 |
| -0.863999999999997 | -0.41 | -0.306 | -0.228 |
| -0.859999999999997 | -0.41 | -0.304 | -0.225 |
| -0.855999999999997 | -0.411 | -0.301 | -0.221 |
| -0.851999999999997 | -0.412 | -0.299 | -0.217 |
| -0.847999999999997 | -0.413 | -0.297 | -0.214 |
| -0.843999999999997 | -0.414 | -0.295 | -0.21 |
| -0.839999999999997 | -0.415 | -0.293 | -0.207 |
| -0.835999999999997 | -0.416 | -0.29 | -0.203 |
| -0.831999999999997 | -0.416 | -0.288 | -0.2 |
| -0.827999999999997 | -0.417 | -0.286 | -0.196 |
| -0.823999999999997 | -0.418 | -0.284 | -0.193 |
| -0.819999999999997 | -0.419 | -0.281 | -0.189 |
| -0.815999999999997 | -0.419 | -0.279 | -0.186 |
| -0.811999999999997 | -0.42 | -0.277 | -0.183 |
| -0.807999999999997 | -0.421 | -0.275 | -0.179 |
| -0.803999999999997 | -0.421 | -0.272 | -0.176 |
| -0.799999999999997 | -0.422 | -0.27 | -0.173 |
| -0.795999999999997 | -0.422 | -0.268 | -0.17 |
| -0.791999999999997 | -0.423 | -0.265 | -0.166 |
| -0.787999999999997 | -0.424 | -0.263 | -0.163 |
| -0.783999999999997 | -0.424 | -0.261 | -0.16 |
| -0.779999999999997 | -0.424 | -0.258 | -0.157 |
| -0.775999999999997 | -0.425 | -0.256 | -0.154 |
| -0.771999999999997 | -0.425 | -0.254 | -0.151 |
| -0.767999999999997 | -0.426 | -0.251 | -0.148 |
| -0.763999999999997 | -0.426 | -0.249 | -0.145 |
| -0.759999999999997 | -0.427 | -0.246 | -0.142 |
| -0.755999999999997 | -0.427 | -0.244 | -0.139 |
| -0.751999999999997 | -0.427 | -0.242 | -0.137 |
| -0.747999999999997 | -0.427 | -0.239 | -0.134 |
| -0.743999999999997 | -0.428 | -0.237 | -0.131 |
| -0.739999999999997 | -0.428 | -0.234 | -0.128 |
| -0.735999999999997 | -0.428 | -0.232 | -0.126 |
| -0.731999999999997 | -0.428 | -0.23 | -0.123 |
| -0.727999999999997 | -0.429 | -0.227 | -0.12 |
| -0.723999999999997 | -0.429 | -0.225 | -0.118 |
| -0.719999999999997 | -0.429 | -0.222 | -0.115 |
| -0.715999999999997 | -0.429 | -0.22 | -0.113 |
| -0.711999999999997 | -0.429 | -0.217 | -0.11 |
| -0.707999999999997 | -0.429 | -0.215 | -0.108 |
| -0.703999999999997 | -0.429 | -0.213 | -0.105 |
| -0.699999999999997 | -0.429 | -0.21 | -0.103 |
| -0.695999999999997 | -0.429 | -0.208 | -0.101 |
| -0.691999999999997 | -0.429 | -0.205 | -0.098 |
| -0.687999999999997 | -0.429 | -0.203 | -0.096 |
| -0.683999999999997 | -0.428 | -0.2 | -0.094 |
| -0.679999999999997 | -0.428 | -0.198 | -0.092 |
| -0.675999999999997 | -0.428 | -0.196 | -0.089 |
| -0.671999999999997 | -0.428 | -0.193 | -0.087 |
| -0.667999999999997 | -0.428 | -0.191 | -0.085 |
| -0.663999999999997 | -0.427 | -0.188 | -0.083 |
| -0.659999999999997 | -0.427 | -0.186 | -0.081 |
| -0.655999999999997 | -0.427 | -0.184 | -0.079 |
| -0.651999999999997 | -0.426 | -0.181 | -0.077 |
| -0.647999999999997 | -0.426 | -0.179 | -0.075 |
| -0.643999999999997 | -0.425 | -0.176 | -0.073 |
| -0.639999999999997 | -0.425 | -0.174 | -0.071 |
| -0.635999999999997 | -0.424 | -0.172 | -0.069 |
| -0.631999999999997 | -0.424 | -0.169 | -0.068 |
| -0.627999999999997 | -0.423 | -0.167 | -0.066 |
| -0.623999999999997 | -0.423 | -0.165 | -0.064 |
| -0.619999999999997 | -0.422 | -0.162 | -0.062 |
| -0.615999999999997 | -0.421 | -0.16 | -0.061 |
| -0.611999999999997 | -0.421 | -0.158 | -0.059 |
| -0.607999999999997 | -0.42 | -0.155 | -0.057 |
| -0.603999999999997 | -0.419 | -0.153 | -0.056 |
| -0.599999999999997 | -0.419 | -0.151 | -0.054 |
| -0.595999999999997 | -0.418 | -0.148 | -0.053 |
| -0.591999999999997 | -0.417 | -0.146 | -0.051 |
| -0.587999999999997 | -0.416 | -0.144 | -0.05 |
| -0.583999999999997 | -0.415 | -0.142 | -0.048 |
| -0.579999999999997 | -0.414 | -0.139 | -0.047 |
| -0.575999999999997 | -0.413 | -0.137 | -0.046 |
| -0.571999999999997 | -0.412 | -0.135 | -0.044 |
| -0.567999999999997 | -0.411 | -0.133 | -0.043 |
| -0.563999999999997 | -0.41 | -0.131 | -0.042 |
| -0.559999999999997 | -0.409 | -0.128 | -0.04 |
| -0.555999999999997 | -0.408 | -0.126 | -0.039 |
| -0.551999999999997 | -0.407 | -0.124 | -0.038 |
| -0.547999999999997 | -0.406 | -0.122 | -0.037 |
| -0.543999999999997 | -0.405 | -0.12 | -0.035 |
| -0.539999999999997 | -0.403 | -0.118 | -0.034 |
| -0.535999999999997 | -0.402 | -0.116 | -0.033 |
| -0.531999999999997 | -0.401 | -0.113 | -0.032 |
| -0.527999999999997 | -0.4 | -0.111 | -0.031 |
| -0.523999999999997 | -0.398 | -0.109 | -0.03 |
| -0.519999999999997 | -0.397 | -0.107 | -0.029 |
| -0.515999999999997 | -0.395 | -0.105 | -0.028 |
| -0.511999999999997 | -0.394 | -0.103 | -0.027 |
| -0.507999999999997 | -0.392 | -0.101 | -0.026 |
| -0.503999999999997 | -0.391 | -0.099 | -0.025 |
| -0.499999999999997 | -0.389 | -0.097 | -0.024 |
| -0.495999999999997 | -0.388 | -0.095 | -0.023 |
| -0.491999999999997 | -0.386 | -0.093 | -0.023 |
| -0.487999999999997 | -0.385 | -0.092 | -0.022 |
| -0.483999999999997 | -0.383 | -0.09 | -0.021 |
| -0.479999999999997 | -0.381 | -0.088 | -0.02 |
| -0.475999999999997 | -0.379 | -0.086 | -0.019 |
| -0.471999999999997 | -0.378 | -0.084 | -0.019 |
| -0.467999999999997 | -0.376 | -0.082 | -0.018 |
| -0.463999999999997 | -0.374 | -0.081 | -0.017 |
| -0.459999999999997 | -0.372 | -0.079 | -0.017 |
| -0.455999999999997 | -0.37 | -0.077 | -0.016 |
| -0.451999999999997 | -0.368 | -0.075 | -0.015 |
| -0.447999999999997 | -0.367 | -0.074 | -0.015 |
| -0.443999999999997 | -0.365 | -0.072 | -0.014 |
| -0.439999999999997 | -0.363 | -0.07 | -0.014 |
| -0.435999999999997 | -0.361 | -0.069 | -0.013 |
| -0.431999999999997 | -0.358 | -0.067 | -0.012 |
| -0.427999999999997 | -0.356 | -0.065 | -0.012 |
| -0.423999999999997 | -0.354 | -0.064 | -0.011 |
| -0.419999999999997 | -0.352 | -0.062 | -0.011 |
| -0.415999999999997 | -0.35 | -0.061 | -0.01 |
| -0.411999999999997 | -0.348 | -0.059 | -0.01 |
| -0.407999999999997 | -0.345 | -0.058 | -0.01 |
| -0.403999999999997 | -0.343 | -0.056 | -0.009 |
| -0.399999999999997 | -0.341 | -0.055 | -0.009 |
| -0.395999999999997 | -0.339 | -0.053 | -0.008 |
| -0.391999999999997 | -0.336 | -0.052 | -0.008 |
| -0.387999999999997 | -0.334 | -0.05 | -0.008 |
| -0.383999999999997 | -0.331 | -0.049 | -0.007 |
| -0.379999999999997 | -0.329 | -0.047 | -0.007 |
| -0.375999999999997 | -0.326 | -0.046 | -0.007 |
| -0.371999999999997 | -0.324 | -0.045 | -0.006 |
| -0.367999999999997 | -0.321 | -0.044 | -0.006 |
| -0.363999999999997 | -0.319 | -0.042 | -0.006 |
| -0.359999999999997 | -0.316 | -0.041 | -0.005 |
| -0.355999999999997 | -0.314 | -0.04 | -0.005 |
| -0.351999999999997 | -0.311 | -0.039 | -0.005 |
| -0.347999999999997 | -0.308 | -0.037 | -0.005 |
| -0.343999999999997 | -0.306 | -0.036 | -0.004 |
| -0.339999999999997 | -0.303 | -0.035 | -0.004 |
| -0.335999999999997 | -0.3 | -0.034 | -0.004 |
| -0.331999999999997 | -0.297 | -0.033 | -0.004 |
| -0.327999999999997 | -0.295 | -0.032 | -0.003 |
| -0.323999999999997 | -0.292 | -0.031 | -0.003 |
| -0.319999999999997 | -0.289 | -0.03 | -0.003 |
| -0.315999999999997 | -0.286 | -0.029 | -0.003 |
| -0.311999999999997 | -0.283 | -0.028 | -0.003 |
| -0.307999999999997 | -0.28 | -0.027 | -0.003 |
| -0.303999999999997 | -0.277 | -0.026 | -0.002 |
| -0.299999999999997 | -0.274 | -0.025 | -0.002 |
| -0.295999999999997 | -0.271 | -0.024 | -0.002 |
| -0.291999999999997 | -0.268 | -0.023 | -0.002 |
| -0.287999999999997 | -0.265 | -0.022 | -0.002 |
| -0.283999999999997 | -0.262 | -0.021 | -0.002 |
| -0.279999999999997 | -0.259 | -0.02 | -0.002 |
| -0.275999999999997 | -0.256 | -0.019 | -0.001 |
| -0.271999999999997 | -0.253 | -0.019 | -0.001 |
| -0.267999999999997 | -0.249 | -0.018 | -0.001 |
| -0.263999999999997 | -0.246 | -0.017 | -0.001 |
| -0.259999999999997 | -0.243 | -0.016 | -0.001 |
| -0.255999999999997 | -0.24 | -0.016 | -0.001 |
| -0.251999999999997 | -0.236 | -0.015 | -0.001 |
| -0.247999999999997 | -0.233 | -0.014 | -0.001 |
| -0.243999999999997 | -0.23 | -0.014 | -0.001 |
| -0.239999999999997 | -0.227 | -0.013 | -0.001 |
| -0.235999999999997 | -0.223 | -0.012 | -0.001 |
| -0.231999999999997 | -0.22 | -0.012 | -0.001 |
| -0.227999999999997 | -0.216 | -0.011 | -0.001 |
| -0.223999999999997 | -0.213 | -0.011 | -0.001 |
| -0.219999999999997 | -0.21 | -0.01 | 0 |
| -0.215999999999997 | -0.206 | -0.01 | 0 |
| -0.211999999999997 | -0.203 | -0.009 | 0 |
| -0.207999999999997 | -0.199 | -0.009 | 0 |
| -0.203999999999997 | -0.196 | -0.008 | 0 |
| -0.199999999999997 | -0.192 | -0.008 | 0 |
| -0.195999999999997 | -0.189 | -0.007 | 0 |
| -0.191999999999997 | -0.185 | -0.007 | 0 |
| -0.187999999999997 | -0.181 | -0.006 | 0 |
| -0.183999999999997 | -0.178 | -0.006 | 0 |
| -0.179999999999997 | -0.174 | -0.006 | 0 |
| -0.175999999999997 | -0.171 | -0.005 | 0 |
| -0.171999999999997 | -0.167 | -0.005 | 0 |
| -0.167999999999997 | -0.163 | -0.005 | 0 |
| -0.163999999999997 | -0.16 | -0.004 | 0 |
| -0.159999999999997 | -0.156 | -0.004 | 0 |
| -0.155999999999997 | -0.152 | -0.004 | 0 |
| -0.151999999999997 | -0.149 | -0.003 | 0 |
| -0.147999999999997 | -0.145 | -0.003 | 0 |
| -0.143999999999997 | -0.141 | -0.003 | 0 |
| -0.139999999999997 | -0.137 | -0.003 | 0 |
| -0.135999999999997 | -0.134 | -0.002 | 0 |
| -0.131999999999997 | -0.13 | -0.002 | 0 |
| -0.127999999999997 | -0.126 | -0.002 | 0 |
| -0.123999999999997 | -0.122 | -0.002 | 0 |
| -0.119999999999997 | -0.118 | -0.002 | 0 |
| -0.115999999999997 | -0.114 | -0.002 | 0 |
| -0.111999999999997 | -0.111 | -0.001 | 0 |
| -0.107999999999997 | -0.107 | -0.001 | 0 |
| -0.103999999999997 | -0.103 | -0.001 | 0 |
| -0.0999999999999965 | -0.099 | -0.001 | 0 |
| -0.0959999999999965 | -0.095 | -0.001 | 0 |
| -0.0919999999999965 | -0.091 | -0.001 | 0 |
| -0.0879999999999965 | -0.087 | -0.001 | 0 |
| -0.0839999999999965 | -0.083 | -0.001 | 0 |
| -0.0799999999999965 | -0.079 | -0.001 | 0 |
| -0.0759999999999965 | -0.076 | 0 | 0 |
| -0.0719999999999965 | -0.072 | 0 | 0 |
| -0.0679999999999965 | -0.068 | 0 | 0 |
| -0.0639999999999965 | -0.064 | 0 | 0 |
| -0.0599999999999965 | -0.06 | 0 | 0 |
| -0.0559999999999965 | -0.056 | 0 | 0 |
| -0.0519999999999965 | -0.052 | 0 | 0 |
| -0.0479999999999965 | -0.048 | 0 | 0 |
| -0.0439999999999965 | -0.044 | 0 | 0 |
| -0.0399999999999965 | -0.04 | 0 | 0 |
| -0.0359999999999965 | -0.036 | 0 | 0 |
| -0.0319999999999965 | -0.032 | 0 | 0 |
| -0.0279999999999965 | -0.028 | 0 | 0 |
| -0.0239999999999965 | -0.024 | 0 | 0 |
| -0.0199999999999965 | -0.02 | 0 | 0 |
| -0.0159999999999965 | -0.016 | 0 | 0 |
| -0.0119999999999965 | -0.012 | 0 | 0 |
| -0.00799999999999647 | -0.008 | 0 | 0 |
| -0.00399999999999647 | -0.004 | 0 | 0 |
| 3.52495810318487e-15 | 0 | 0 | 0 |
| 0.00400000000000352 | 0.004 | 0 | 0 |
| 0.00800000000000352 | 0.008 | 0 | 0 |
| 0.0120000000000035 | 0.012 | 0 | 0 |
| 0.0160000000000035 | 0.016 | 0 | 0 |
| 0.0200000000000035 | 0.02 | 0 | 0 |
| 0.0240000000000035 | 0.024 | 0 | 0 |
| 0.0280000000000035 | 0.028 | 0 | 0 |
| 0.0320000000000035 | 0.032 | 0 | 0 |
| 0.0360000000000035 | 0.036 | 0 | 0 |
| 0.0400000000000035 | 0.04 | 0 | 0 |
| 0.0440000000000035 | 0.044 | 0 | 0 |
| 0.0480000000000035 | 0.048 | 0 | 0 |
| 0.0520000000000035 | 0.052 | 0 | 0 |
| 0.0560000000000035 | 0.056 | 0 | 0 |
| 0.0600000000000035 | 0.06 | 0 | 0 |
| 0.0640000000000035 | 0.064 | 0 | 0 |
| 0.0680000000000035 | 0.068 | 0 | 0 |
| 0.0720000000000036 | 0.072 | 0 | 0 |
| 0.0760000000000036 | 0.076 | 0 | 0 |
| 0.0800000000000036 | 0.079 | 0.001 | 0 |
| 0.0840000000000036 | 0.083 | 0.001 | 0 |
| 0.0880000000000036 | 0.087 | 0.001 | 0 |
| 0.0920000000000036 | 0.091 | 0.001 | 0 |
| 0.0960000000000036 | 0.095 | 0.001 | 0 |
| 0.100000000000004 | 0.099 | 0.001 | 0 |
| 0.104000000000004 | 0.103 | 0.001 | 0 |
| 0.108000000000004 | 0.107 | 0.001 | 0 |
| 0.112000000000004 | 0.111 | 0.001 | 0 |
| 0.116000000000004 | 0.114 | 0.002 | 0 |
| 0.120000000000004 | 0.118 | 0.002 | 0 |
| 0.124000000000004 | 0.122 | 0.002 | 0 |
| 0.128000000000004 | 0.126 | 0.002 | 0 |
| 0.132000000000004 | 0.13 | 0.002 | 0 |
| 0.136000000000004 | 0.134 | 0.002 | 0 |
| 0.140000000000004 | 0.137 | 0.003 | 0 |
| 0.144000000000004 | 0.141 | 0.003 | 0 |
| 0.148000000000004 | 0.145 | 0.003 | 0 |
| 0.152000000000004 | 0.149 | 0.003 | 0 |
| 0.156000000000004 | 0.152 | 0.004 | 0 |
| 0.160000000000004 | 0.156 | 0.004 | 0 |
| 0.164000000000004 | 0.16 | 0.004 | 0 |
| 0.168000000000004 | 0.163 | 0.005 | 0 |
| 0.172000000000004 | 0.167 | 0.005 | 0 |
| 0.176000000000004 | 0.171 | 0.005 | 0 |
| 0.180000000000004 | 0.174 | 0.006 | 0 |
| 0.184000000000004 | 0.178 | 0.006 | 0 |
| 0.188000000000004 | 0.181 | 0.006 | 0 |
| 0.192000000000004 | 0.185 | 0.007 | 0 |
| 0.196000000000004 | 0.189 | 0.007 | 0 |
| 0.200000000000004 | 0.192 | 0.008 | 0 |
| 0.204000000000004 | 0.196 | 0.008 | 0 |
| 0.208000000000004 | 0.199 | 0.009 | 0 |
| 0.212000000000004 | 0.203 | 0.009 | 0 |
| 0.216000000000004 | 0.206 | 0.01 | 0 |
| 0.220000000000004 | 0.21 | 0.01 | 0 |
| 0.224000000000004 | 0.213 | 0.011 | 0.001 |
| 0.228000000000004 | 0.216 | 0.011 | 0.001 |
| 0.232000000000004 | 0.22 | 0.012 | 0.001 |
| 0.236000000000004 | 0.223 | 0.012 | 0.001 |
| 0.240000000000004 | 0.227 | 0.013 | 0.001 |
| 0.244000000000004 | 0.23 | 0.014 | 0.001 |
| 0.248000000000004 | 0.233 | 0.014 | 0.001 |
| 0.252000000000004 | 0.236 | 0.015 | 0.001 |
| 0.256000000000004 | 0.24 | 0.016 | 0.001 |
| 0.260000000000004 | 0.243 | 0.016 | 0.001 |
| 0.264000000000004 | 0.246 | 0.017 | 0.001 |
| 0.268000000000004 | 0.249 | 0.018 | 0.001 |
| 0.272000000000004 | 0.253 | 0.019 | 0.001 |
| 0.276000000000004 | 0.256 | 0.019 | 0.001 |
| 0.280000000000004 | 0.259 | 0.02 | 0.002 |
| 0.284000000000004 | 0.262 | 0.021 | 0.002 |
| 0.288000000000004 | 0.265 | 0.022 | 0.002 |
| 0.292000000000004 | 0.268 | 0.023 | 0.002 |
| 0.296000000000004 | 0.271 | 0.024 | 0.002 |
| 0.300000000000004 | 0.274 | 0.025 | 0.002 |
| 0.304000000000004 | 0.277 | 0.026 | 0.002 |
| 0.308000000000004 | 0.28 | 0.027 | 0.003 |
| 0.312000000000004 | 0.283 | 0.028 | 0.003 |
| 0.316000000000004 | 0.286 | 0.029 | 0.003 |
| 0.320000000000004 | 0.289 | 0.03 | 0.003 |
| 0.324000000000004 | 0.292 | 0.031 | 0.003 |
| 0.328000000000004 | 0.295 | 0.032 | 0.003 |
| 0.332000000000004 | 0.297 | 0.033 | 0.004 |
| 0.336000000000004 | 0.3 | 0.034 | 0.004 |
| 0.340000000000004 | 0.303 | 0.035 | 0.004 |
| 0.344000000000004 | 0.306 | 0.036 | 0.004 |
| 0.348000000000004 | 0.308 | 0.037 | 0.005 |
| 0.352000000000004 | 0.311 | 0.039 | 0.005 |
| 0.356000000000004 | 0.314 | 0.04 | 0.005 |
| 0.360000000000004 | 0.316 | 0.041 | 0.005 |
| 0.364000000000004 | 0.319 | 0.042 | 0.006 |
| 0.368000000000004 | 0.321 | 0.044 | 0.006 |
| 0.372000000000004 | 0.324 | 0.045 | 0.006 |
| 0.376000000000004 | 0.326 | 0.046 | 0.007 |
| 0.380000000000004 | 0.329 | 0.047 | 0.007 |
| 0.384000000000004 | 0.331 | 0.049 | 0.007 |
| 0.388000000000004 | 0.334 | 0.05 | 0.008 |
| 0.392000000000004 | 0.336 | 0.052 | 0.008 |
| 0.396000000000004 | 0.339 | 0.053 | 0.008 |
| 0.400000000000004 | 0.341 | 0.055 | 0.009 |
| 0.404000000000004 | 0.343 | 0.056 | 0.009 |
| 0.408000000000004 | 0.345 | 0.058 | 0.01 |
| 0.412000000000004 | 0.348 | 0.059 | 0.01 |
| 0.416000000000004 | 0.35 | 0.061 | 0.01 |
| 0.420000000000004 | 0.352 | 0.062 | 0.011 |
| 0.424000000000004 | 0.354 | 0.064 | 0.011 |
| 0.428000000000004 | 0.356 | 0.065 | 0.012 |
| 0.432000000000004 | 0.358 | 0.067 | 0.012 |
| 0.436000000000004 | 0.361 | 0.069 | 0.013 |
| 0.440000000000004 | 0.363 | 0.07 | 0.014 |
| 0.444000000000004 | 0.365 | 0.072 | 0.014 |
| 0.448000000000004 | 0.367 | 0.074 | 0.015 |
| 0.452000000000004 | 0.368 | 0.075 | 0.015 |
| 0.456000000000004 | 0.37 | 0.077 | 0.016 |
| 0.460000000000004 | 0.372 | 0.079 | 0.017 |
| 0.464000000000004 | 0.374 | 0.081 | 0.017 |
| 0.468000000000004 | 0.376 | 0.082 | 0.018 |
| 0.472000000000004 | 0.378 | 0.084 | 0.019 |
| 0.476000000000004 | 0.379 | 0.086 | 0.019 |
| 0.480000000000004 | 0.381 | 0.088 | 0.02 |
| 0.484000000000004 | 0.383 | 0.09 | 0.021 |
| 0.488000000000004 | 0.385 | 0.092 | 0.022 |
| 0.492000000000004 | 0.386 | 0.093 | 0.023 |
| 0.496000000000004 | 0.388 | 0.095 | 0.023 |
| 0.500000000000004 | 0.389 | 0.097 | 0.024 |
| 0.504000000000004 | 0.391 | 0.099 | 0.025 |
| 0.508000000000004 | 0.392 | 0.101 | 0.026 |
| 0.512000000000004 | 0.394 | 0.103 | 0.027 |
| 0.516000000000004 | 0.395 | 0.105 | 0.028 |
| 0.520000000000004 | 0.397 | 0.107 | 0.029 |
| 0.524000000000004 | 0.398 | 0.109 | 0.03 |
| 0.528000000000004 | 0.4 | 0.111 | 0.031 |
| 0.532000000000004 | 0.401 | 0.113 | 0.032 |
| 0.536000000000004 | 0.402 | 0.116 | 0.033 |
| 0.540000000000004 | 0.403 | 0.118 | 0.034 |
| 0.544000000000004 | 0.405 | 0.12 | 0.035 |
| 0.548000000000004 | 0.406 | 0.122 | 0.037 |
| 0.552000000000004 | 0.407 | 0.124 | 0.038 |
| 0.556000000000004 | 0.408 | 0.126 | 0.039 |
| 0.560000000000004 | 0.409 | 0.128 | 0.04 |
| 0.564000000000004 | 0.41 | 0.131 | 0.042 |
| 0.568000000000004 | 0.411 | 0.133 | 0.043 |
| 0.572000000000004 | 0.412 | 0.135 | 0.044 |
| 0.576000000000004 | 0.413 | 0.137 | 0.046 |
| 0.580000000000004 | 0.414 | 0.139 | 0.047 |
| 0.584000000000004 | 0.415 | 0.142 | 0.048 |
| 0.588000000000004 | 0.416 | 0.144 | 0.05 |
| 0.592000000000004 | 0.417 | 0.146 | 0.051 |
| 0.596000000000004 | 0.418 | 0.148 | 0.053 |
| 0.600000000000004 | 0.419 | 0.151 | 0.054 |
| 0.604000000000004 | 0.419 | 0.153 | 0.056 |
| 0.608000000000004 | 0.42 | 0.155 | 0.057 |
| 0.612000000000004 | 0.421 | 0.158 | 0.059 |
| 0.616000000000004 | 0.421 | 0.16 | 0.061 |
| 0.620000000000004 | 0.422 | 0.162 | 0.062 |
| 0.624000000000004 | 0.423 | 0.165 | 0.064 |
| 0.628000000000004 | 0.423 | 0.167 | 0.066 |
| 0.632000000000004 | 0.424 | 0.169 | 0.068 |
| 0.636000000000004 | 0.424 | 0.172 | 0.069 |
| 0.640000000000004 | 0.425 | 0.174 | 0.071 |
| 0.644000000000004 | 0.425 | 0.176 | 0.073 |
| 0.648000000000004 | 0.426 | 0.179 | 0.075 |
| 0.652000000000004 | 0.426 | 0.181 | 0.077 |
| 0.656000000000004 | 0.427 | 0.184 | 0.079 |
| 0.660000000000004 | 0.427 | 0.186 | 0.081 |
| 0.664000000000004 | 0.427 | 0.188 | 0.083 |
| 0.668000000000004 | 0.428 | 0.191 | 0.085 |
| 0.672000000000004 | 0.428 | 0.193 | 0.087 |
| 0.676000000000004 | 0.428 | 0.196 | 0.089 |
| 0.680000000000004 | 0.428 | 0.198 | 0.092 |
| 0.684000000000004 | 0.428 | 0.2 | 0.094 |
| 0.688000000000004 | 0.429 | 0.203 | 0.096 |
| 0.692000000000004 | 0.429 | 0.205 | 0.098 |
| 0.696000000000004 | 0.429 | 0.208 | 0.101 |
| 0.700000000000004 | 0.429 | 0.21 | 0.103 |
| 0.704000000000004 | 0.429 | 0.213 | 0.105 |
| 0.708000000000004 | 0.429 | 0.215 | 0.108 |
| 0.712000000000004 | 0.429 | 0.217 | 0.11 |
| 0.716000000000004 | 0.429 | 0.22 | 0.113 |
| 0.720000000000004 | 0.429 | 0.222 | 0.115 |
| 0.724000000000004 | 0.429 | 0.225 | 0.118 |
| 0.728000000000004 | 0.429 | 0.227 | 0.12 |
| 0.732000000000004 | 0.428 | 0.23 | 0.123 |
| 0.736000000000004 | 0.428 | 0.232 | 0.126 |
| 0.740000000000004 | 0.428 | 0.234 | 0.128 |
| 0.744000000000004 | 0.428 | 0.237 | 0.131 |
| 0.748000000000004 | 0.427 | 0.239 | 0.134 |
| 0.752000000000004 | 0.427 | 0.242 | 0.137 |
| 0.756000000000004 | 0.427 | 0.244 | 0.139 |
| 0.760000000000004 | 0.427 | 0.246 | 0.142 |
| 0.764000000000004 | 0.426 | 0.249 | 0.145 |
| 0.768000000000004 | 0.426 | 0.251 | 0.148 |
| 0.772000000000004 | 0.425 | 0.254 | 0.151 |
| 0.776000000000004 | 0.425 | 0.256 | 0.154 |
| 0.780000000000004 | 0.424 | 0.258 | 0.157 |
| 0.784000000000004 | 0.424 | 0.261 | 0.16 |
| 0.788000000000004 | 0.424 | 0.263 | 0.163 |
| 0.792000000000004 | 0.423 | 0.265 | 0.166 |
| 0.796000000000004 | 0.422 | 0.268 | 0.17 |
| 0.800000000000004 | 0.422 | 0.27 | 0.173 |
| 0.804000000000004 | 0.421 | 0.272 | 0.176 |
| 0.808000000000004 | 0.421 | 0.275 | 0.179 |
| 0.812000000000004 | 0.42 | 0.277 | 0.183 |
| 0.816000000000004 | 0.419 | 0.279 | 0.186 |
| 0.820000000000004 | 0.419 | 0.281 | 0.189 |
| 0.824000000000004 | 0.418 | 0.284 | 0.193 |
| 0.828000000000004 | 0.417 | 0.286 | 0.196 |
| 0.832000000000004 | 0.416 | 0.288 | 0.2 |
| 0.836000000000004 | 0.416 | 0.29 | 0.203 |
| 0.840000000000004 | 0.415 | 0.293 | 0.207 |
| 0.844000000000004 | 0.414 | 0.295 | 0.21 |
| 0.848000000000004 | 0.413 | 0.297 | 0.214 |
| 0.852000000000004 | 0.412 | 0.299 | 0.217 |
| 0.856000000000004 | 0.411 | 0.301 | 0.221 |
| 0.860000000000004 | 0.41 | 0.304 | 0.225 |
| 0.864000000000004 | 0.41 | 0.306 | 0.228 |
| 0.868000000000004 | 0.409 | 0.308 | 0.232 |
| 0.872000000000004 | 0.408 | 0.31 | 0.236 |
| 0.876000000000004 | 0.407 | 0.312 | 0.239 |
| 0.880000000000004 | 0.406 | 0.314 | 0.243 |
| 0.884000000000004 | 0.405 | 0.316 | 0.247 |
| 0.888000000000004 | 0.404 | 0.318 | 0.251 |
| 0.892000000000004 | 0.403 | 0.32 | 0.255 |
| 0.896000000000004 | 0.401 | 0.322 | 0.259 |
| 0.900000000000004 | 0.4 | 0.324 | 0.263 |
| 0.904000000000004 | 0.399 | 0.326 | 0.267 |
| 0.908000000000004 | 0.398 | 0.328 | 0.271 |
| 0.912000000000004 | 0.397 | 0.33 | 0.275 |
| 0.916000000000004 | 0.396 | 0.332 | 0.279 |
| 0.920000000000004 | 0.395 | 0.334 | 0.283 |
| 0.924000000000004 | 0.393 | 0.336 | 0.287 |
| 0.928000000000004 | 0.392 | 0.338 | 0.291 |
| 0.932000000000004 | 0.391 | 0.34 | 0.295 |
| 0.936000000000004 | 0.39 | 0.341 | 0.299 |
| 0.940000000000004 | 0.388 | 0.343 | 0.303 |
| 0.944000000000004 | 0.387 | 0.345 | 0.307 |
| 0.948000000000004 | 0.386 | 0.347 | 0.312 |
| 0.952000000000004 | 0.385 | 0.349 | 0.316 |
| 0.956000000000004 | 0.383 | 0.35 | 0.32 |
| 0.960000000000004 | 0.382 | 0.352 | 0.324 |
| 0.964000000000004 | 0.381 | 0.354 | 0.329 |
| 0.968000000000004 | 0.379 | 0.355 | 0.333 |
| 0.972000000000004 | 0.378 | 0.357 | 0.337 |
| 0.976000000000004 | 0.376 | 0.359 | 0.342 |
| 0.980000000000004 | 0.375 | 0.36 | 0.346 |
| 0.984000000000004 | 0.374 | 0.362 | 0.35 |
| 0.988000000000004 | 0.372 | 0.363 | 0.355 |
| 0.992000000000004 | 0.371 | 0.365 | 0.359 |
| 0.996000000000004 | 0.369 | 0.366 | 0.363 |
| 1.000000000000004 | 0.368 | 0.368 | 0.368 |
| 1.004000000000004 | 0.366 | 0.369 | 0.372 |
| 1.008000000000004 | 0.365 | 0.371 | 0.377 |
| 1.012000000000004 | 0.363 | 0.372 | 0.381 |
| 1.016000000000004 | 0.362 | 0.374 | 0.386 |
| 1.020000000000004 | 0.36 | 0.375 | 0.39 |
| 1.024000000000004 | 0.359 | 0.376 | 0.395 |
| 1.028000000000004 | 0.357 | 0.378 | 0.399 |
| 1.032000000000004 | 0.356 | 0.379 | 0.404 |
| 1.036000000000004 | 0.354 | 0.38 | 0.408 |
| 1.040000000000004 | 0.353 | 0.381 | 0.413 |
| 1.044000000000004 | 0.351 | 0.383 | 0.417 |
| 1.048000000000004 | 0.349 | 0.384 | 0.422 |
| 1.052000000000004 | 0.348 | 0.385 | 0.426 |
| 1.056000000000004 | 0.346 | 0.386 | 0.431 |
| 1.060000000000004 | 0.345 | 0.387 | 0.435 |
| 1.064000000000004 | 0.343 | 0.388 | 0.44 |
| 1.068000000000004 | 0.341 | 0.389 | 0.444 |
| 1.072000000000004 | 0.34 | 0.39 | 0.449 |
| 1.076000000000004 | 0.338 | 0.391 | 0.453 |
| 1.080000000000004 | 0.336 | 0.392 | 0.458 |
| 1.084000000000004 | 0.335 | 0.393 | 0.462 |
| 1.088000000000004 | 0.333 | 0.394 | 0.467 |
| 1.092000000000004 | 0.331 | 0.395 | 0.471 |
| 1.096000000000004 | 0.33 | 0.396 | 0.476 |
| 1.100000000000004 | 0.328 | 0.397 | 0.48 |
| 1.104000000000004 | 0.326 | 0.398 | 0.485 |
| 1.108000000000004 | 0.325 | 0.399 | 0.489 |
| 1.112000000000004 | 0.323 | 0.399 | 0.494 |
| 1.116000000000004 | 0.321 | 0.4 | 0.498 |
| 1.120000000000004 | 0.319 | 0.401 | 0.503 |
| 1.124000000000004 | 0.318 | 0.401 | 0.507 |
| 1.128000000000004 | 0.316 | 0.402 | 0.512 |
| 1.132000000000004 | 0.314 | 0.403 | 0.516 |
| 1.136000000000004 | 0.313 | 0.403 | 0.521 |
| 1.140000000000004 | 0.311 | 0.404 | 0.525 |
| 1.144000000000004 | 0.309 | 0.404 | 0.529 |
| 1.148000000000004 | 0.307 | 0.405 | 0.534 |
| 1.152000000000004 | 0.306 | 0.406 | 0.538 |
| 1.156000000000004 | 0.304 | 0.406 | 0.543 |
| 1.160000000000004 | 0.302 | 0.406 | 0.547 |
| 1.164000000000004 | 0.3 | 0.407 | 0.551 |
| 1.168000000000004 | 0.299 | 0.407 | 0.556 |
| 1.172000000000004 | 0.297 | 0.408 | 0.56 |
| 1.176000000000004 | 0.295 | 0.408 | 0.564 |
| 1.180000000000004 | 0.293 | 0.408 | 0.568 |
| 1.184000000000004 | 0.291 | 0.409 | 0.573 |
| 1.188000000000004 | 0.29 | 0.409 | 0.577 |
| 1.192000000000004 | 0.288 | 0.409 | 0.581 |
| 1.196000000000004 | 0.286 | 0.409 | 0.585 |
| 1.200000000000004 | 0.284 | 0.409 | 0.59 |
| 1.204000000000004 | 0.283 | 0.41 | 0.594 |
| 1.208000000000004 | 0.281 | 0.41 | 0.598 |
| 1.212000000000004 | 0.279 | 0.41 | 0.602 |
| 1.216000000000004 | 0.277 | 0.41 | 0.606 |
| 1.220000000000004 | 0.275 | 0.41 | 0.61 |
| 1.224000000000004 | 0.274 | 0.41 | 0.614 |
| 1.228000000000004 | 0.272 | 0.41 | 0.618 |
| 1.232000000000004 | 0.27 | 0.41 | 0.622 |
| 1.236000000000004 | 0.268 | 0.41 | 0.626 |
| 1.240000000000004 | 0.266 | 0.41 | 0.63 |
| 1.244000000000004 | 0.265 | 0.41 | 0.634 |
| 1.248000000000004 | 0.263 | 0.409 | 0.638 |
| 1.252000000000004 | 0.261 | 0.409 | 0.642 |
| 1.256000000000004 | 0.259 | 0.409 | 0.645 |
| 1.260000000000004 | 0.258 | 0.409 | 0.649 |
| 1.264000000000004 | 0.256 | 0.409 | 0.653 |
| 1.268000000000004 | 0.254 | 0.408 | 0.657 |
| 1.272000000000004 | 0.252 | 0.408 | 0.66 |
| 1.276000000000004 | 0.25 | 0.408 | 0.664 |
| 1.280000000000004 | 0.249 | 0.407 | 0.668 |
| 1.284000000000004 | 0.247 | 0.407 | 0.671 |
| 1.288000000000004 | 0.245 | 0.407 | 0.675 |
| 1.292000000000004 | 0.243 | 0.406 | 0.678 |
| 1.296000000000004 | 0.242 | 0.406 | 0.682 |
| 1.300000000000004 | 0.24 | 0.405 | 0.685 |
| 1.304000000000004 | 0.238 | 0.405 | 0.689 |
| 1.308000000000004 | 0.236 | 0.404 | 0.692 |
| 1.312000000000004 | 0.235 | 0.404 | 0.695 |
| 1.316000000000004 | 0.233 | 0.403 | 0.698 |
| 1.320000000000004 | 0.231 | 0.403 | 0.702 |
| 1.324000000000004 | 0.229 | 0.402 | 0.705 |
| 1.328000000000004 | 0.228 | 0.401 | 0.708 |
| 1.332000000000004 | 0.226 | 0.401 | 0.711 |
| 1.336000000000004 | 0.224 | 0.4 | 0.714 |
| 1.340000000000004 | 0.222 | 0.399 | 0.717 |
| 1.344000000000004 | 0.221 | 0.399 | 0.72 |
| 1.348000000000004 | 0.219 | 0.398 | 0.723 |
| 1.352000000000004 | 0.217 | 0.397 | 0.726 |
| 1.356000000000004 | 0.216 | 0.396 | 0.729 |
| 1.360000000000004 | 0.214 | 0.396 | 0.732 |
| 1.364000000000004 | 0.212 | 0.395 | 0.735 |
| 1.368000000000004 | 0.211 | 0.394 | 0.737 |
| 1.372000000000004 | 0.209 | 0.393 | 0.74 |
| 1.376000000000004 | 0.207 | 0.392 | 0.743 |
| 1.380000000000004 | 0.205 | 0.391 | 0.745 |
| 1.384000000000004 | 0.204 | 0.39 | 0.748 |
| 1.388000000000005 | 0.202 | 0.389 | 0.75 |
| 1.392000000000004 | 0.201 | 0.389 | 0.753 |
| 1.396000000000004 | 0.199 | 0.388 | 0.755 |
| 1.400000000000005 | 0.197 | 0.387 | 0.758 |
| 1.404000000000005 | 0.196 | 0.385 | 0.76 |
| 1.408000000000005 | 0.194 | 0.384 | 0.762 |
| 1.412000000000005 | 0.192 | 0.383 | 0.764 |
| 1.416000000000005 | 0.191 | 0.382 | 0.767 |
| 1.420000000000005 | 0.189 | 0.381 | 0.769 |
| 1.424000000000005 | 0.187 | 0.38 | 0.771 |
| 1.428000000000005 | 0.186 | 0.379 | 0.773 |
| 1.432000000000005 | 0.184 | 0.378 | 0.775 |
| 1.436000000000005 | 0.183 | 0.377 | 0.777 |
| 1.440000000000005 | 0.181 | 0.375 | 0.779 |
| 1.444000000000005 | 0.179 | 0.374 | 0.78 |
| 1.448000000000005 | 0.178 | 0.373 | 0.782 |
| 1.452000000000005 | 0.176 | 0.372 | 0.784 |
| 1.456000000000005 | 0.175 | 0.371 | 0.785 |
| 1.460000000000005 | 0.173 | 0.369 | 0.787 |
| 1.464000000000005 | 0.172 | 0.368 | 0.789 |
| 1.468000000000005 | 0.17 | 0.367 | 0.79 |
| 1.472000000000005 | 0.169 | 0.365 | 0.792 |
| 1.476000000000005 | 0.167 | 0.364 | 0.793 |
| 1.480000000000005 | 0.166 | 0.363 | 0.794 |
| 1.484000000000005 | 0.164 | 0.361 | 0.796 |
| 1.488000000000005 | 0.163 | 0.36 | 0.797 |
| 1.492000000000005 | 0.161 | 0.359 | 0.798 |
| 1.496000000000005 | 0.16 | 0.357 | 0.799 |
| 1.500000000000005 | 0.158 | 0.356 | 0.8 |
| 1.504000000000005 | 0.157 | 0.354 | 0.801 |
| 1.508000000000005 | 0.155 | 0.353 | 0.802 |
| 1.512000000000005 | 0.154 | 0.351 | 0.803 |
| 1.516000000000005 | 0.152 | 0.35 | 0.804 |
| 1.520000000000005 | 0.151 | 0.348 | 0.805 |
| 1.524000000000005 | 0.149 | 0.347 | 0.806 |
| 1.528000000000005 | 0.148 | 0.345 | 0.807 |
| 1.532000000000005 | 0.147 | 0.344 | 0.807 |
| 1.536000000000005 | 0.145 | 0.342 | 0.808 |
| 1.540000000000005 | 0.144 | 0.341 | 0.808 |
| 1.544000000000005 | 0.142 | 0.339 | 0.809 |
| 1.548000000000005 | 0.141 | 0.338 | 0.809 |
| 1.552000000000005 | 0.14 | 0.336 | 0.81 |
| 1.556000000000005 | 0.138 | 0.335 | 0.81 |
| 1.560000000000005 | 0.137 | 0.333 | 0.81 |
| 1.564000000000005 | 0.135 | 0.331 | 0.811 |
| 1.568000000000005 | 0.134 | 0.33 | 0.811 |
| 1.572000000000005 | 0.133 | 0.328 | 0.811 |
| 1.576000000000005 | 0.131 | 0.327 | 0.811 |
| 1.580000000000005 | 0.13 | 0.325 | 0.811 |
| 1.584000000000005 | 0.129 | 0.323 | 0.811 |
| 1.588000000000005 | 0.128 | 0.322 | 0.811 |
| 1.592000000000005 | 0.126 | 0.32 | 0.811 |
| 1.596000000000005 | 0.125 | 0.318 | 0.811 |
| 1.600000000000005 | 0.124 | 0.317 | 0.811 |
| 1.604000000000005 | 0.122 | 0.315 | 0.81 |
| 1.608000000000005 | 0.121 | 0.313 | 0.81 |
| 1.612000000000005 | 0.12 | 0.312 | 0.81 |
| 1.616000000000005 | 0.119 | 0.31 | 0.809 |
| 1.620000000000005 | 0.117 | 0.308 | 0.809 |
| 1.624000000000005 | 0.116 | 0.306 | 0.808 |
| 1.628000000000005 | 0.115 | 0.305 | 0.808 |
| 1.632000000000005 | 0.114 | 0.303 | 0.807 |
| 1.636000000000005 | 0.113 | 0.301 | 0.806 |
| 1.640000000000005 | 0.111 | 0.3 | 0.806 |
| 1.644000000000005 | 0.11 | 0.298 | 0.805 |
| 1.648000000000005 | 0.109 | 0.296 | 0.804 |
| 1.652000000000005 | 0.108 | 0.294 | 0.803 |
| 1.656000000000005 | 0.107 | 0.293 | 0.802 |
| 1.660000000000005 | 0.106 | 0.291 | 0.801 |
| 1.664000000000005 | 0.104 | 0.289 | 0.8 |
| 1.668000000000005 | 0.103 | 0.287 | 0.799 |
| 1.672000000000005 | 0.102 | 0.285 | 0.798 |
| 1.676000000000005 | 0.101 | 0.284 | 0.797 |
| 1.680000000000005 | 0.1 | 0.282 | 0.796 |
| 1.684000000000005 | 0.099 | 0.28 | 0.795 |
| 1.688000000000005 | 0.098 | 0.278 | 0.793 |
| 1.692000000000005 | 0.097 | 0.277 | 0.792 |
| 1.696000000000005 | 0.096 | 0.275 | 0.791 |
| 1.700000000000005 | 0.094 | 0.273 | 0.789 |
| 1.704000000000005 | 0.093 | 0.271 | 0.788 |
| 1.708000000000005 | 0.092 | 0.269 | 0.786 |
| 1.712000000000005 | 0.091 | 0.268 | 0.785 |
| 1.716000000000005 | 0.09 | 0.266 | 0.783 |
| 1.720000000000005 | 0.089 | 0.264 | 0.781 |
| 1.724000000000005 | 0.088 | 0.262 | 0.78 |
| 1.728000000000005 | 0.087 | 0.261 | 0.778 |
| 1.732000000000005 | 0.086 | 0.259 | 0.776 |
| 1.736000000000005 | 0.085 | 0.257 | 0.774 |
| 1.740000000000005 | 0.084 | 0.255 | 0.772 |
| 1.744000000000005 | 0.083 | 0.253 | 0.771 |
| 1.748000000000005 | 0.082 | 0.252 | 0.769 |
| 1.752000000000005 | 0.081 | 0.25 | 0.767 |
| 1.756000000000005 | 0.08 | 0.248 | 0.765 |
| 1.760000000000005 | 0.079 | 0.246 | 0.763 |
| 1.764000000000005 | 0.079 | 0.244 | 0.761 |
| 1.768000000000005 | 0.078 | 0.243 | 0.758 |
| 1.772000000000005 | 0.077 | 0.241 | 0.756 |
| 1.776000000000005 | 0.076 | 0.239 | 0.754 |
| 1.780000000000005 | 0.075 | 0.237 | 0.752 |
| 1.784000000000005 | 0.074 | 0.235 | 0.749 |
| 1.788000000000005 | 0.073 | 0.234 | 0.747 |
| 1.792000000000005 | 0.072 | 0.232 | 0.745 |
| 1.796000000000005 | 0.071 | 0.23 | 0.742 |
| 1.800000000000005 | 0.07 | 0.228 | 0.74 |
| 1.804000000000005 | 0.07 | 0.227 | 0.738 |
| 1.808000000000005 | 0.069 | 0.225 | 0.735 |
| 1.812000000000005 | 0.068 | 0.223 | 0.733 |
| 1.816000000000005 | 0.067 | 0.221 | 0.73 |
| 1.820000000000005 | 0.066 | 0.22 | 0.727 |
| 1.824000000000005 | 0.065 | 0.218 | 0.725 |
| 1.828000000000005 | 0.065 | 0.216 | 0.722 |
| 1.832000000000005 | 0.064 | 0.214 | 0.72 |
| 1.836000000000005 | 0.063 | 0.213 | 0.717 |
| 1.840000000000005 | 0.062 | 0.211 | 0.714 |
| 1.844000000000005 | 0.062 | 0.209 | 0.711 |
| 1.848000000000005 | 0.061 | 0.207 | 0.709 |
| 1.852000000000005 | 0.06 | 0.206 | 0.706 |
| 1.856000000000005 | 0.059 | 0.204 | 0.703 |
| 1.860000000000005 | 0.058 | 0.202 | 0.7 |
| 1.864000000000005 | 0.058 | 0.201 | 0.697 |
| 1.868000000000005 | 0.057 | 0.199 | 0.694 |
| 1.872000000000005 | 0.056 | 0.197 | 0.691 |
| 1.876000000000005 | 0.056 | 0.196 | 0.688 |
| 1.880000000000005 | 0.055 | 0.194 | 0.685 |
| 1.884000000000005 | 0.054 | 0.192 | 0.682 |
| 1.888000000000005 | 0.053 | 0.191 | 0.679 |
| 1.892000000000005 | 0.053 | 0.189 | 0.676 |
| 1.896000000000005 | 0.052 | 0.187 | 0.673 |
| 1.900000000000005 | 0.051 | 0.186 | 0.67 |
| 1.904000000000005 | 0.051 | 0.184 | 0.667 |
| 1.908000000000005 | 0.05 | 0.182 | 0.664 |
| 1.912000000000005 | 0.049 | 0.181 | 0.66 |
| 1.916000000000005 | 0.049 | 0.179 | 0.657 |
| 1.920000000000005 | 0.048 | 0.177 | 0.654 |
| 1.924000000000005 | 0.047 | 0.176 | 0.651 |
| 1.928000000000005 | 0.047 | 0.174 | 0.647 |
| 1.932000000000005 | 0.046 | 0.173 | 0.644 |
| 1.936000000000005 | 0.046 | 0.171 | 0.641 |
| 1.940000000000005 | 0.045 | 0.169 | 0.638 |
| 1.944000000000005 | 0.044 | 0.168 | 0.634 |
| 1.948000000000005 | 0.044 | 0.166 | 0.631 |
| 1.952000000000005 | 0.043 | 0.165 | 0.627 |
| 1.956000000000005 | 0.043 | 0.163 | 0.624 |
| 1.960000000000005 | 0.042 | 0.162 | 0.621 |
| 1.964000000000005 | 0.041 | 0.16 | 0.617 |
| 1.968000000000005 | 0.041 | 0.159 | 0.614 |
| 1.972000000000005 | 0.04 | 0.157 | 0.61 |
| 1.976000000000005 | 0.04 | 0.155 | 0.607 |
| 1.980000000000005 | 0.039 | 0.154 | 0.604 |
| 1.984000000000005 | 0.039 | 0.152 | 0.6 |
| 1.988000000000005 | 0.038 | 0.151 | 0.597 |
| 1.992000000000005 | 0.038 | 0.149 | 0.593 |
| 1.996000000000005 | 0.037 | 0.148 | 0.59 |
| 2.000000000000005 | 0.037 | 0.147 | 0.586 |
| 2.004000000000005 | 0.036 | 0.145 | 0.583 |
| 2.008000000000005 | 0.036 | 0.144 | 0.579 |
| 2.012000000000005 | 0.035 | 0.142 | 0.576 |
| 2.016000000000005 | 0.035 | 0.141 | 0.572 |
| 2.020000000000005 | 0.034 | 0.139 | 0.568 |
| 2.024000000000005 | 0.034 | 0.138 | 0.565 |
| 2.028000000000005 | 0.033 | 0.136 | 0.561 |
| 2.032000000000005 | 0.033 | 0.135 | 0.558 |
| 2.036000000000005 | 0.032 | 0.134 | 0.554 |
| 2.040000000000005 | 0.032 | 0.132 | 0.551 |
| 2.044000000000005 | 0.031 | 0.131 | 0.547 |
| 2.048000000000005 | 0.031 | 0.13 | 0.543 |
| 2.052000000000005 | 0.03 | 0.128 | 0.54 |
| 2.056000000000005 | 0.03 | 0.127 | 0.536 |
| 2.060000000000005 | 0.03 | 0.125 | 0.533 |
| 2.064000000000005 | 0.029 | 0.124 | 0.529 |
| 2.068000000000005 | 0.029 | 0.123 | 0.525 |
| 2.072000000000005 | 0.028 | 0.122 | 0.522 |
| 2.076000000000005 | 0.028 | 0.12 | 0.518 |
| 2.080000000000005 | 0.027 | 0.119 | 0.514 |
| 2.084000000000005 | 0.027 | 0.118 | 0.511 |
| 2.088000000000005 | 0.027 | 0.116 | 0.507 |
| 2.092000000000005 | 0.026 | 0.115 | 0.504 |
| 2.096000000000005 | 0.026 | 0.114 | 0.5 |
| 2.100000000000005 | 0.026 | 0.113 | 0.496 |
| 2.104000000000005 | 0.025 | 0.111 | 0.493 |
| 2.108000000000005 | 0.025 | 0.11 | 0.489 |
| 2.112000000000005 | 0.024 | 0.109 | 0.486 |
| 2.116000000000005 | 0.024 | 0.108 | 0.482 |
| 2.120000000000005 | 0.024 | 0.106 | 0.478 |
| 2.124000000000005 | 0.023 | 0.105 | 0.475 |
| 2.128000000000005 | 0.023 | 0.104 | 0.471 |
| 2.132000000000005 | 0.023 | 0.103 | 0.468 |
| 2.136000000000005 | 0.022 | 0.102 | 0.464 |
| 2.140000000000005 | 0.022 | 0.101 | 0.46 |
| 2.144000000000005 | 0.022 | 0.099 | 0.457 |
| 2.148000000000005 | 0.021 | 0.098 | 0.453 |
| 2.152000000000005 | 0.021 | 0.097 | 0.45 |
| 2.156000000000005 | 0.021 | 0.096 | 0.446 |
| 2.160000000000005 | 0.02 | 0.095 | 0.443 |
| 2.164000000000005 | 0.02 | 0.094 | 0.439 |
| 2.168000000000005 | 0.02 | 0.093 | 0.436 |
| 2.172000000000005 | 0.019 | 0.092 | 0.432 |
| 2.176000000000005 | 0.019 | 0.09 | 0.428 |
| 2.180000000000005 | 0.019 | 0.089 | 0.425 |
| 2.184000000000005 | 0.019 | 0.088 | 0.421 |
| 2.188000000000005 | 0.018 | 0.087 | 0.418 |
| 2.192000000000005 | 0.018 | 0.086 | 0.414 |
| 2.196000000000005 | 0.018 | 0.085 | 0.411 |
| 2.200000000000005 | 0.017 | 0.084 | 0.408 |
| 2.204000000000005 | 0.017 | 0.083 | 0.404 |
| 2.208000000000005 | 0.017 | 0.082 | 0.401 |
| 2.212000000000005 | 0.017 | 0.081 | 0.397 |
| 2.216000000000005 | 0.016 | 0.08 | 0.394 |
| 2.220000000000005 | 0.016 | 0.079 | 0.39 |
| 2.224000000000005 | 0.016 | 0.078 | 0.387 |
| 2.228000000000005 | 0.016 | 0.077 | 0.383 |
| 2.232000000000005 | 0.015 | 0.076 | 0.38 |
| 2.236000000000005 | 0.015 | 0.075 | 0.377 |
| 2.240000000000005 | 0.015 | 0.074 | 0.373 |
| 2.244000000000005 | 0.015 | 0.073 | 0.37 |
| 2.248000000000005 | 0.014 | 0.073 | 0.367 |
| 2.252000000000005 | 0.014 | 0.072 | 0.363 |
| 2.256000000000005 | 0.014 | 0.071 | 0.36 |
| 2.260000000000005 | 0.014 | 0.07 | 0.357 |
| 2.264000000000005 | 0.013 | 0.069 | 0.353 |
| 2.268000000000005 | 0.013 | 0.068 | 0.35 |
| 2.272000000000005 | 0.013 | 0.067 | 0.347 |
| 2.276000000000005 | 0.013 | 0.066 | 0.344 |
| 2.280000000000005 | 0.013 | 0.065 | 0.34 |
| 2.284000000000005 | 0.012 | 0.065 | 0.337 |
| 2.288000000000005 | 0.012 | 0.064 | 0.334 |
| 2.292000000000005 | 0.012 | 0.063 | 0.331 |
| 2.296000000000005 | 0.012 | 0.062 | 0.328 |
| 2.300000000000005 | 0.012 | 0.061 | 0.325 |
| 2.304000000000005 | 0.011 | 0.061 | 0.321 |
| 2.308000000000005 | 0.011 | 0.06 | 0.318 |
| 2.312000000000005 | 0.011 | 0.059 | 0.315 |
| 2.316000000000005 | 0.011 | 0.058 | 0.312 |
| 2.320000000000005 | 0.011 | 0.057 | 0.309 |
| 2.324000000000005 | 0.01 | 0.057 | 0.306 |
| 2.328000000000005 | 0.01 | 0.056 | 0.303 |
| 2.332000000000005 | 0.01 | 0.055 | 0.3 |
| 2.336000000000005 | 0.01 | 0.054 | 0.297 |
| 2.340000000000005 | 0.01 | 0.054 | 0.294 |
| 2.344000000000005 | 0.01 | 0.053 | 0.291 |
| 2.348000000000005 | 0.009 | 0.052 | 0.288 |
| 2.352000000000005 | 0.009 | 0.052 | 0.285 |
| 2.356000000000005 | 0.009 | 0.051 | 0.282 |
| 2.360000000000005 | 0.009 | 0.05 | 0.279 |
| 2.364000000000005 | 0.009 | 0.049 | 0.276 |
| 2.368000000000005 | 0.009 | 0.049 | 0.273 |
| 2.372000000000005 | 0.009 | 0.048 | 0.27 |
| 2.376000000000005 | 0.008 | 0.047 | 0.268 |
| 2.380000000000005 | 0.008 | 0.047 | 0.265 |
| 2.384000000000005 | 0.008 | 0.046 | 0.262 |
| 2.388000000000005 | 0.008 | 0.045 | 0.259 |
| 2.392000000000005 | 0.008 | 0.045 | 0.256 |
| 2.396000000000005 | 0.008 | 0.044 | 0.254 |
| 2.400000000000005 | 0.008 | 0.044 | 0.251 |
| 2.404000000000005 | 0.007 | 0.043 | 0.248 |
| 2.408000000000005 | 0.007 | 0.042 | 0.245 |
| 2.412000000000005 | 0.007 | 0.042 | 0.243 |
| 2.416000000000005 | 0.007 | 0.041 | 0.24 |
| 2.420000000000005 | 0.007 | 0.041 | 0.238 |
| 2.424000000000005 | 0.007 | 0.04 | 0.235 |
| 2.428000000000005 | 0.007 | 0.039 | 0.232 |
| 2.432000000000005 | 0.007 | 0.039 | 0.23 |
| 2.436000000000005 | 0.006 | 0.038 | 0.227 |
| 2.440000000000005 | 0.006 | 0.038 | 0.225 |
| 2.444000000000005 | 0.006 | 0.037 | 0.222 |
| 2.448000000000005 | 0.006 | 0.037 | 0.22 |
| 2.452000000000005 | 0.006 | 0.036 | 0.217 |
| 2.456000000000005 | 0.006 | 0.036 | 0.215 |
| 2.460000000000005 | 0.006 | 0.035 | 0.212 |
| 2.464000000000005 | 0.006 | 0.035 | 0.21 |
| 2.468000000000005 | 0.006 | 0.034 | 0.207 |
| 2.472000000000005 | 0.005 | 0.034 | 0.205 |
| 2.476000000000005 | 0.005 | 0.033 | 0.202 |
| 2.480000000000005 | 0.005 | 0.033 | 0.2 |
| 2.484000000000005 | 0.005 | 0.032 | 0.198 |
| 2.488000000000005 | 0.005 | 0.032 | 0.195 |
| 2.492000000000005 | 0.005 | 0.031 | 0.193 |
| 2.496000000000005 | 0.005 | 0.031 | 0.191 |
| 2.500000000000005 | 0.005 | 0.03 | 0.189 |
| 2.504000000000005 | 0.005 | 0.03 | 0.186 |
| 2.508000000000005 | 0.005 | 0.029 | 0.184 |
| 2.512000000000005 | 0.005 | 0.029 | 0.182 |
| 2.516000000000005 | 0.004 | 0.028 | 0.18 |
| 2.520000000000005 | 0.004 | 0.028 | 0.177 |
| 2.524000000000005 | 0.004 | 0.028 | 0.175 |
| 2.528000000000005 | 0.004 | 0.027 | 0.173 |
| 2.532000000000005 | 0.004 | 0.027 | 0.171 |
| 2.536000000000005 | 0.004 | 0.026 | 0.169 |
| 2.540000000000005 | 0.004 | 0.026 | 0.167 |
| 2.544000000000005 | 0.004 | 0.025 | 0.165 |
| 2.548000000000005 | 0.004 | 0.025 | 0.163 |
| 2.552000000000005 | 0.004 | 0.025 | 0.161 |
| 2.556000000000005 | 0.004 | 0.024 | 0.159 |
| 2.560000000000005 | 0.004 | 0.024 | 0.157 |
| 2.564000000000005 | 0.004 | 0.024 | 0.155 |
| 2.568000000000005 | 0.004 | 0.023 | 0.153 |
| 2.572000000000005 | 0.003 | 0.023 | 0.151 |
| 2.576000000000005 | 0.003 | 0.022 | 0.149 |
| 2.580000000000005 | 0.003 | 0.022 | 0.147 |
| 2.584000000000005 | 0.003 | 0.022 | 0.145 |
| 2.588000000000005 | 0.003 | 0.021 | 0.143 |
| 2.592000000000005 | 0.003 | 0.021 | 0.141 |
| 2.596000000000005 | 0.003 | 0.021 | 0.14 |
| 2.600000000000005 | 0.003 | 0.02 | 0.138 |
| 2.604000000000005 | 0.003 | 0.02 | 0.136 |
| 2.608000000000005 | 0.003 | 0.02 | 0.134 |
| 2.612000000000005 | 0.003 | 0.019 | 0.132 |
| 2.616000000000005 | 0.003 | 0.019 | 0.131 |
| 2.620000000000005 | 0.003 | 0.019 | 0.129 |
| 2.624000000000005 | 0.003 | 0.018 | 0.127 |
| 2.628000000000005 | 0.003 | 0.018 | 0.126 |
| 2.632000000000005 | 0.003 | 0.018 | 0.124 |
| 2.636000000000005 | 0.003 | 0.018 | 0.122 |
| 2.640000000000005 | 0.002 | 0.017 | 0.121 |
| 2.644000000000005 | 0.002 | 0.017 | 0.119 |
| 2.648000000000005 | 0.002 | 0.017 | 0.117 |
| 2.652000000000005 | 0.002 | 0.016 | 0.116 |
| 2.656000000000005 | 0.002 | 0.016 | 0.114 |
| 2.660000000000005 | 0.002 | 0.016 | 0.113 |
| 2.664000000000005 | 0.002 | 0.016 | 0.111 |
| 2.668000000000005 | 0.002 | 0.015 | 0.11 |
| 2.672000000000005 | 0.002 | 0.015 | 0.108 |
| 2.676000000000005 | 0.002 | 0.015 | 0.107 |
| 2.680000000000005 | 0.002 | 0.015 | 0.105 |
| 2.684000000000005 | 0.002 | 0.014 | 0.104 |
| 2.688000000000005 | 0.002 | 0.014 | 0.102 |
| 2.692000000000005 | 0.002 | 0.014 | 0.101 |
| 2.696000000000005 | 0.002 | 0.014 | 0.099 |
| 2.700000000000005 | 0.002 | 0.013 | 0.098 |
| 2.704000000000005 | 0.002 | 0.013 | 0.097 |
| 2.708000000000005 | 0.002 | 0.013 | 0.095 |
| 2.712000000000005 | 0.002 | 0.013 | 0.094 |
| 2.716000000000005 | 0.002 | 0.013 | 0.092 |
| 2.720000000000005 | 0.002 | 0.012 | 0.091 |
| 2.724000000000005 | 0.002 | 0.012 | 0.09 |
| 2.728000000000005 | 0.002 | 0.012 | 0.089 |
| 2.732000000000005 | 0.002 | 0.012 | 0.087 |
| 2.736000000000005 | 0.002 | 0.011 | 0.086 |
| 2.740000000000005 | 0.002 | 0.011 | 0.085 |
| 2.744000000000005 | 0.001 | 0.011 | 0.084 |
| 2.748000000000005 | 0.001 | 0.011 | 0.082 |
| 2.752000000000005 | 0.001 | 0.011 | 0.081 |
| 2.756000000000005 | 0.001 | 0.011 | 0.08 |
| 2.760000000000005 | 0.001 | 0.01 | 0.079 |
| 2.764000000000005 | 0.001 | 0.01 | 0.078 |
| 2.768000000000005 | 0.001 | 0.01 | 0.076 |
| 2.772000000000005 | 0.001 | 0.01 | 0.075 |
| 2.776000000000005 | 0.001 | 0.01 | 0.074 |
| 2.780000000000005 | 0.001 | 0.009 | 0.073 |
| 2.784000000000005 | 0.001 | 0.009 | 0.072 |
| 2.788000000000006 | 0.001 | 0.009 | 0.071 |
| 2.792000000000005 | 0.001 | 0.009 | 0.07 |
| 2.796000000000005 | 0.001 | 0.009 | 0.069 |
| 2.800000000000006 | 0.001 | 0.009 | 0.068 |
| 2.804000000000006 | 0.001 | 0.008 | 0.067 |
| 2.808000000000006 | 0.001 | 0.008 | 0.066 |
| 2.812000000000006 | 0.001 | 0.008 | 0.065 |
| 2.816000000000006 | 0.001 | 0.008 | 0.064 |
| 2.820000000000006 | 0.001 | 0.008 | 0.063 |
| 2.824000000000006 | 0.001 | 0.008 | 0.062 |
| 2.828000000000006 | 0.001 | 0.008 | 0.061 |
| 2.832000000000006 | 0.001 | 0.007 | 0.06 |
| 2.836000000000006 | 0.001 | 0.007 | 0.059 |
| 2.840000000000006 | 0.001 | 0.007 | 0.058 |
| 2.844000000000006 | 0.001 | 0.007 | 0.057 |
| 2.848000000000006 | 0.001 | 0.007 | 0.056 |
| 2.852000000000006 | 0.001 | 0.007 | 0.055 |
| 2.856000000000006 | 0.001 | 0.007 | 0.054 |
| 2.860000000000006 | 0.001 | 0.007 | 0.054 |
| 2.864000000000006 | 0.001 | 0.006 | 0.053 |
| 2.868000000000006 | 0.001 | 0.006 | 0.052 |
| 2.872000000000006 | 0.001 | 0.006 | 0.051 |
| 2.876000000000006 | 0.001 | 0.006 | 0.05 |
| 2.880000000000006 | 0.001 | 0.006 | 0.05 |
| 2.884000000000006 | 0.001 | 0.006 | 0.049 |
| 2.888000000000006 | 0.001 | 0.006 | 0.048 |
| 2.892000000000006 | 0.001 | 0.006 | 0.047 |
| 2.896000000000006 | 0.001 | 0.006 | 0.046 |
| 2.900000000000006 | 0.001 | 0.005 | 0.046 |
| 2.904000000000006 | 0.001 | 0.005 | 0.045 |
| 2.908000000000006 | 0.001 | 0.005 | 0.044 |
| 2.912000000000006 | 0.001 | 0.005 | 0.043 |
| 2.916000000000006 | 0.001 | 0.005 | 0.043 |
| 2.920000000000006 | 0.001 | 0.005 | 0.042 |
| 2.924000000000006 | 0.001 | 0.005 | 0.041 |
| 2.928000000000006 | 0.001 | 0.005 | 0.041 |
| 2.932000000000006 | 0.001 | 0.005 | 0.04 |
| 2.936000000000006 | 0.001 | 0.005 | 0.039 |
| 2.940000000000006 | 0.001 | 0.004 | 0.039 |
| 2.944000000000006 | 0.001 | 0.004 | 0.038 |
| 2.948000000000006 | 0 | 0.004 | 0.037 |
| 2.952000000000006 | 0 | 0.004 | 0.037 |
| 2.956000000000006 | 0 | 0.004 | 0.036 |
| 2.960000000000006 | 0 | 0.004 | 0.036 |
| 2.964000000000006 | 0 | 0.004 | 0.035 |
| 2.968000000000006 | 0 | 0.004 | 0.034 |
| 2.972000000000006 | 0 | 0.004 | 0.034 |
| 2.976000000000006 | 0 | 0.004 | 0.033 |
| 2.980000000000006 | 0 | 0.004 | 0.033 |
| 2.984000000000006 | 0 | 0.004 | 0.032 |
| 2.988000000000006 | 0 | 0.004 | 0.032 |
| 2.992000000000006 | 0 | 0.003 | 0.031 |
| 2.996000000000006 | 0 | 0.003 | 0.031 |
| 3.000000000000006 | 0 | 0.003 | 0.03 |
| 3.004000000000006 | 0 | 0.003 | 0.029 |
| 3.008000000000006 | 0 | 0.003 | 0.029 |
| 3.012000000000006 | 0 | 0.003 | 0.028 |
| 3.016000000000006 | 0 | 0.003 | 0.028 |
| 3.020000000000006 | 0 | 0.003 | 0.027 |
| 3.024000000000006 | 0 | 0.003 | 0.027 |
| 3.028000000000006 | 0 | 0.003 | 0.027 |
| 3.032000000000006 | 0 | 0.003 | 0.026 |
| 3.036000000000006 | 0 | 0.003 | 0.026 |
| 3.040000000000006 | 0 | 0.003 | 0.025 |
| 3.044000000000006 | 0 | 0.003 | 0.025 |
| 3.048000000000006 | 0 | 0.003 | 0.024 |
| 3.052000000000006 | 0 | 0.003 | 0.024 |
| 3.056000000000006 | 0 | 0.003 | 0.023 |
| 3.060000000000006 | 0 | 0.002 | 0.023 |
| 3.064000000000006 | 0 | 0.002 | 0.023 |
| 3.068000000000006 | 0 | 0.002 | 0.022 |
| 3.072000000000006 | 0 | 0.002 | 0.022 |
| 3.076000000000006 | 0 | 0.002 | 0.021 |
| 3.080000000000006 | 0 | 0.002 | 0.021 |
| 3.084000000000006 | 0 | 0.002 | 0.021 |
| 3.088000000000006 | 0 | 0.002 | 0.02 |
| 3.092000000000006 | 0 | 0.002 | 0.02 |
| 3.096000000000006 | 0 | 0.002 | 0.02 |
| 3.100000000000006 | 0 | 0.002 | 0.019 |
| 3.104000000000006 | 0 | 0.002 | 0.019 |
| 3.108000000000006 | 0 | 0.002 | 0.019 |
| 3.112000000000006 | 0 | 0.002 | 0.018 |
| 3.116000000000006 | 0 | 0.002 | 0.018 |
| 3.120000000000006 | 0 | 0.002 | 0.018 |
| 3.124000000000006 | 0 | 0.002 | 0.017 |
| 3.128000000000006 | 0 | 0.002 | 0.017 |
| 3.132000000000006 | 0 | 0.002 | 0.017 |
| 3.136000000000006 | 0 | 0.002 | 0.016 |
| 3.140000000000006 | 0 | 0.002 | 0.016 |
| 3.144000000000006 | 0 | 0.002 | 0.016 |
| 3.148000000000006 | 0 | 0.002 | 0.015 |
| 3.152000000000006 | 0 | 0.002 | 0.015 |
| 3.156000000000006 | 0 | 0.001 | 0.015 |
| 3.160000000000006 | 0 | 0.001 | 0.015 |
| 3.164000000000006 | 0 | 0.001 | 0.014 |
| 3.168000000000006 | 0 | 0.001 | 0.014 |
| 3.172000000000006 | 0 | 0.001 | 0.014 |
| 3.176000000000006 | 0 | 0.001 | 0.013 |
| 3.180000000000006 | 0 | 0.001 | 0.013 |
| 3.184000000000006 | 0 | 0.001 | 0.013 |
| 3.188000000000006 | 0 | 0.001 | 0.013 |
| 3.192000000000006 | 0 | 0.001 | 0.012 |
| 3.196000000000006 | 0 | 0.001 | 0.012 |
| 3.200000000000006 | 0 | 0.001 | 0.012 |
| 3.204000000000006 | 0 | 0.001 | 0.012 |
| 3.208000000000006 | 0 | 0.001 | 0.012 |
| 3.212000000000006 | 0 | 0.001 | 0.011 |
| 3.216000000000006 | 0 | 0.001 | 0.011 |
| 3.220000000000006 | 0 | 0.001 | 0.011 |
| 3.224000000000006 | 0 | 0.001 | 0.011 |
| 3.228000000000006 | 0 | 0.001 | 0.01 |
| 3.232000000000006 | 0 | 0.001 | 0.01 |
| 3.236000000000006 | 0 | 0.001 | 0.01 |
| 3.240000000000006 | 0 | 0.001 | 0.01 |
| 3.244000000000006 | 0 | 0.001 | 0.01 |
| 3.248000000000006 | 0 | 0.001 | 0.009 |
| 3.252000000000006 | 0 | 0.001 | 0.009 |
| 3.256000000000006 | 0 | 0.001 | 0.009 |
| 3.260000000000006 | 0 | 0.001 | 0.009 |
| 3.264000000000006 | 0 | 0.001 | 0.009 |
| 3.268000000000006 | 0 | 0.001 | 0.009 |
| 3.272000000000006 | 0 | 0.001 | 0.008 |
| 3.276000000000006 | 0 | 0.001 | 0.008 |
| 3.280000000000006 | 0 | 0.001 | 0.008 |
| 3.284000000000006 | 0 | 0.001 | 0.008 |
| 3.288000000000006 | 0 | 0.001 | 0.008 |
| 3.292000000000006 | 0 | 0.001 | 0.008 |
| 3.296000000000006 | 0 | 0.001 | 0.007 |
| 3.300000000000006 | 0 | 0.001 | 0.007 |
| 3.304000000000006 | 0 | 0.001 | 0.007 |
| 3.308000000000006 | 0 | 0.001 | 0.007 |
| 3.312000000000006 | 0 | 0.001 | 0.007 |
| 3.316000000000006 | 0 | 0.001 | 0.007 |
| 3.320000000000006 | 0 | 0.001 | 0.007 |
| 3.324000000000006 | 0 | 0.001 | 0.006 |
| 3.328000000000006 | 0 | 0.001 | 0.006 |
| 3.332000000000006 | 0 | 0.001 | 0.006 |
| 3.336000000000006 | 0 | 0.001 | 0.006 |
| 3.340000000000006 | 0 | 0.001 | 0.006 |
| 3.344000000000006 | 0 | 0.001 | 0.006 |
| 3.348000000000006 | 0 | 0.001 | 0.006 |
| 3.352000000000006 | 0 | 0 | 0.006 |
| 3.356000000000006 | 0 | 0 | 0.005 |
| 3.360000000000006 | 0 | 0 | 0.005 |
| 3.364000000000006 | 0 | 0 | 0.005 |
| 3.368000000000006 | 0 | 0 | 0.005 |
| 3.372000000000006 | 0 | 0 | 0.005 |
| 3.376000000000006 | 0 | 0 | 0.005 |
| 3.380000000000006 | 0 | 0 | 0.005 |
| 3.384000000000006 | 0 | 0 | 0.005 |
| 3.388000000000006 | 0 | 0 | 0.005 |
| 3.392000000000006 | 0 | 0 | 0.005 |
| 3.396000000000006 | 0 | 0 | 0.004 |
| 3.400000000000006 | 0 | 0 | 0.004 |
| 3.404000000000006 | 0 | 0 | 0.004 |
| 3.408000000000006 | 0 | 0 | 0.004 |
| 3.412000000000006 | 0 | 0 | 0.004 |
| 3.416000000000006 | 0 | 0 | 0.004 |
| 3.420000000000006 | 0 | 0 | 0.004 |
| 3.424000000000006 | 0 | 0 | 0.004 |
| 3.428000000000006 | 0 | 0 | 0.004 |
| 3.432000000000006 | 0 | 0 | 0.004 |
| 3.436000000000006 | 0 | 0 | 0.004 |
| 3.440000000000006 | 0 | 0 | 0.003 |
| 3.444000000000006 | 0 | 0 | 0.003 |
| 3.448000000000006 | 0 | 0 | 0.003 |
| 3.452000000000006 | 0 | 0 | 0.003 |
| 3.456000000000006 | 0 | 0 | 0.003 |
| 3.460000000000006 | 0 | 0 | 0.003 |
| 3.464000000000006 | 0 | 0 | 0.003 |
| 3.468000000000006 | 0 | 0 | 0.003 |
| 3.472000000000006 | 0 | 0 | 0.003 |
| 3.476000000000006 | 0 | 0 | 0.003 |
| 3.480000000000006 | 0 | 0 | 0.003 |
| 3.484000000000006 | 0 | 0 | 0.003 |
| 3.488000000000006 | 0 | 0 | 0.003 |
| 3.492000000000006 | 0 | 0 | 0.003 |
| 3.496000000000006 | 0 | 0 | 0.003 |
| 3.500000000000006 | 0 | 0 | 0.003 |
| 3.504000000000006 | 0 | 0 | 0.002 |
| 3.508000000000006 | 0 | 0 | 0.002 |
| 3.512000000000006 | 0 | 0 | 0.002 |
| 3.516000000000006 | 0 | 0 | 0.002 |
| 3.520000000000006 | 0 | 0 | 0.002 |
| 3.524000000000006 | 0 | 0 | 0.002 |
| 3.528000000000006 | 0 | 0 | 0.002 |
| 3.532000000000006 | 0 | 0 | 0.002 |
| 3.536000000000006 | 0 | 0 | 0.002 |
| 3.540000000000006 | 0 | 0 | 0.002 |
| 3.544000000000006 | 0 | 0 | 0.002 |
| 3.548000000000006 | 0 | 0 | 0.002 |
| 3.552000000000006 | 0 | 0 | 0.002 |
| 3.556000000000006 | 0 | 0 | 0.002 |
| 3.560000000000006 | 0 | 0 | 0.002 |
| 3.564000000000006 | 0 | 0 | 0.002 |
| 3.568000000000006 | 0 | 0 | 0.002 |
| 3.572000000000006 | 0 | 0 | 0.002 |
| 3.576000000000006 | 0 | 0 | 0.002 |
| 3.580000000000006 | 0 | 0 | 0.002 |
| 3.584000000000006 | 0 | 0 | 0.002 |
| 3.588000000000006 | 0 | 0 | 0.002 |
| 3.592000000000006 | 0 | 0 | 0.001 |
| 3.596000000000006 | 0 | 0 | 0.001 |
| 3.600000000000006 | 0 | 0 | 0.001 |
| 3.604000000000006 | 0 | 0 | 0.001 |
| 3.608000000000006 | 0 | 0 | 0.001 |
| 3.612000000000006 | 0 | 0 | 0.001 |
| 3.616000000000006 | 0 | 0 | 0.001 |
| 3.620000000000006 | 0 | 0 | 0.001 |
| 3.624000000000006 | 0 | 0 | 0.001 |
| 3.628000000000006 | 0 | 0 | 0.001 |
| 3.632000000000006 | 0 | 0 | 0.001 |
| 3.636000000000006 | 0 | 0 | 0.001 |
| 3.640000000000006 | 0 | 0 | 0.001 |
| 3.644000000000006 | 0 | 0 | 0.001 |
| 3.648000000000006 | 0 | 0 | 0.001 |
| 3.652000000000006 | 0 | 0 | 0.001 |
| 3.656000000000006 | 0 | 0 | 0.001 |
| 3.660000000000006 | 0 | 0 | 0.001 |
| 3.664000000000006 | 0 | 0 | 0.001 |
| 3.668000000000006 | 0 | 0 | 0.001 |
| 3.672000000000006 | 0 | 0 | 0.001 |
| 3.676000000000006 | 0 | 0 | 0.001 |
| 3.680000000000006 | 0 | 0 | 0.001 |
| 3.684000000000006 | 0 | 0 | 0.001 |
| 3.688000000000006 | 0 | 0 | 0.001 |
| 3.692000000000006 | 0 | 0 | 0.001 |
| 3.696000000000006 | 0 | 0 | 0.001 |
| 3.700000000000006 | 0 | 0 | 0.001 |
| 3.704000000000006 | 0 | 0 | 0.001 |
| 3.708000000000006 | 0 | 0 | 0.001 |
| 3.712000000000006 | 0 | 0 | 0.001 |
| 3.716000000000006 | 0 | 0 | 0.001 |
| 3.720000000000006 | 0 | 0 | 0.001 |
| 3.724000000000006 | 0 | 0 | 0.001 |
| 3.728000000000006 | 0 | 0 | 0.001 |
| 3.732000000000006 | 0 | 0 | 0.001 |
| 3.736000000000006 | 0 | 0 | 0.001 |
| 3.740000000000006 | 0 | 0 | 0.001 |
| 3.744000000000006 | 0 | 0 | 0.001 |
| 3.748000000000006 | 0 | 0 | 0.001 |
| 3.752000000000006 | 0 | 0 | 0.001 |
| 3.756000000000006 | 0 | 0 | 0.001 |
| 3.760000000000006 | 0 | 0 | 0.001 |
| 3.764000000000006 | 0 | 0 | 0.001 |
| 3.768000000000006 | 0 | 0 | 0.001 |
| 3.772000000000006 | 0 | 0 | 0.001 |
| 3.776000000000006 | 0 | 0 | 0 |
| 3.780000000000006 | 0 | 0 | 0 |
| 3.784000000000006 | 0 | 0 | 0 |
| 3.788000000000006 | 0 | 0 | 0 |
| 3.792000000000006 | 0 | 0 | 0 |
| 3.796000000000006 | 0 | 0 | 0 |
| 3.800000000000006 | 0 | 0 | 0 |
| 3.804000000000006 | 0 | 0 | 0 |
| 3.808000000000006 | 0 | 0 | 0 |
| 3.812000000000006 | 0 | 0 | 0 |
| 3.816000000000006 | 0 | 0 | 0 |
| 3.820000000000006 | 0 | 0 | 0 |
| 3.824000000000006 | 0 | 0 | 0 |
| 3.828000000000006 | 0 | 0 | 0 |
| 3.832000000000006 | 0 | 0 | 0 |
| 3.836000000000006 | 0 | 0 | 0 |
| 3.840000000000006 | 0 | 0 | 0 |
| 3.844000000000006 | 0 | 0 | 0 |
| 3.848000000000006 | 0 | 0 | 0 |
| 3.852000000000006 | 0 | 0 | 0 |
| 3.856000000000006 | 0 | 0 | 0 |
| 3.860000000000006 | 0 | 0 | 0 |
| 3.864000000000006 | 0 | 0 | 0 |
| 3.868000000000006 | 0 | 0 | 0 |
| 3.872000000000006 | 0 | 0 | 0 |
| 3.876000000000006 | 0 | 0 | 0 |
| 3.880000000000006 | 0 | 0 | 0 |
| 3.884000000000006 | 0 | 0 | 0 |
| 3.888000000000007 | 0 | 0 | 0 |
| 3.892000000000006 | 0 | 0 | 0 |
| 3.896000000000006 | 0 | 0 | 0 |
| 3.900000000000007 | 0 | 0 | 0 |
| 3.904000000000007 | 0 | 0 | 0 |
| 3.908000000000007 | 0 | 0 | 0 |
| 3.912000000000007 | 0 | 0 | 0 |
| 3.916000000000007 | 0 | 0 | 0 |
| 3.920000000000007 | 0 | 0 | 0 |
| 3.924000000000007 | 0 | 0 | 0 |
| 3.928000000000007 | 0 | 0 | 0 |
| 3.932000000000007 | 0 | 0 | 0 |
| 3.936000000000007 | 0 | 0 | 0 |
| 3.940000000000007 | 0 | 0 | 0 |
| 3.944000000000007 | 0 | 0 | 0 |
| 3.948000000000007 | 0 | 0 | 0 |
| 3.952000000000007 | 0 | 0 | 0 |
| 3.956000000000007 | 0 | 0 | 0 |
| 3.960000000000007 | 0 | 0 | 0 |
| 3.964000000000007 | 0 | 0 | 0 |
| 3.968000000000007 | 0 | 0 | 0 |
| 3.972000000000007 | 0 | 0 | 0 |
| 3.976000000000007 | 0 | 0 | 0 |
| 3.980000000000007 | 0 | 0 | 0 |
| 3.984000000000007 | 0 | 0 | 0 |
| 3.988000000000007 | 0 | 0 | 0 |
| 3.992000000000007 | 0 | 0 | 0 |
| 3.996000000000007 | 0 | 0 | 0 |
| 4.000000000000006 | 0 | 0 | 0 |